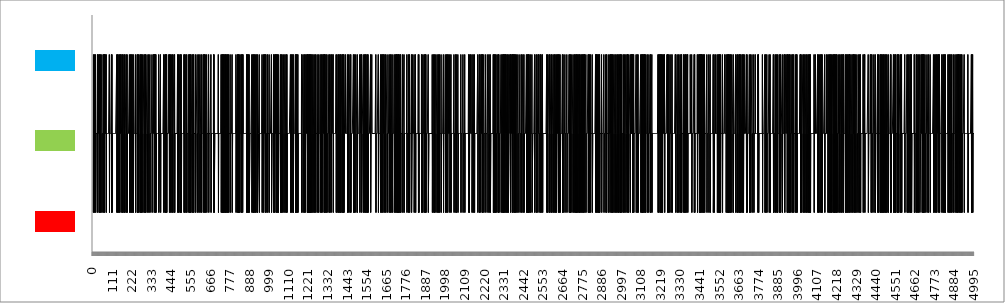
| Category | Series 0 |
|---|---|
| 0.0 | 1 |
| 1.0 | 2 |
| 2.0 | 3 |
| 3.0 | 1 |
| 4.0 | 2 |
| 5.0 | 2 |
| 6.0 | 2 |
| 7.0 | 2 |
| 8.0 | 3 |
| 9.0 | 1 |
| 10.0 | 2 |
| 11.0 | 2 |
| 12.0 | 2 |
| 13.0 | 2 |
| 14.0 | 3 |
| 15.0 | 1 |
| 16.0 | 1 |
| 17.0 | 2 |
| 18.0 | 2 |
| 19.0 | 2 |
| 20.0 | 2 |
| 21.0 | 2 |
| 22.0 | 2 |
| 23.0 | 2 |
| 24.0 | 2 |
| 25.0 | 3 |
| 26.0 | 1 |
| 27.0 | 2 |
| 28.0 | 3 |
| 29.0 | 2 |
| 30.0 | 2 |
| 31.0 | 2 |
| 32.0 | 2 |
| 33.0 | 2 |
| 34.0 | 3 |
| 35.0 | 1 |
| 36.0 | 2 |
| 37.0 | 2 |
| 38.0 | 3 |
| 39.0 | 1 |
| 40.0 | 1 |
| 41.0 | 1 |
| 42.0 | 2 |
| 43.0 | 3 |
| 44.0 | 1 |
| 45.0 | 2 |
| 46.0 | 2 |
| 47.0 | 2 |
| 48.0 | 2 |
| 49.0 | 2 |
| 50.0 | 3 |
| 51.0 | 1 |
| 52.0 | 2 |
| 53.0 | 2 |
| 54.0 | 2 |
| 55.0 | 2 |
| 56.0 | 2 |
| 57.0 | 2 |
| 58.0 | 2 |
| 59.0 | 3 |
| 60.0 | 1 |
| 61.0 | 2 |
| 62.0 | 3 |
| 63.0 | 2 |
| 64.0 | 3 |
| 65.0 | 1 |
| 66.0 | 2 |
| 67.0 | 2 |
| 68.0 | 2 |
| 69.0 | 3 |
| 70.0 | 2 |
| 71.0 | 2 |
| 72.0 | 2 |
| 73.0 | 2 |
| 74.0 | 3 |
| 75.0 | 1 |
| 76.0 | 2 |
| 77.0 | 2 |
| 78.0 | 2 |
| 79.0 | 2 |
| 80.0 | 2 |
| 81.0 | 2 |
| 82.0 | 2 |
| 83.0 | 2 |
| 84.0 | 2 |
| 85.0 | 2 |
| 86.0 | 2 |
| 87.0 | 2 |
| 88.0 | 2 |
| 89.0 | 2 |
| 90.0 | 2 |
| 91.0 | 2 |
| 92.0 | 3 |
| 93.0 | 1 |
| 94.0 | 2 |
| 95.0 | 2 |
| 96.0 | 2 |
| 97.0 | 2 |
| 98.0 | 2 |
| 99.0 | 2 |
| 100.0 | 2 |
| 101.0 | 2 |
| 102.0 | 2 |
| 103.0 | 2 |
| 104.0 | 3 |
| 105.0 | 1 |
| 106.0 | 2 |
| 107.0 | 3 |
| 108.0 | 1 |
| 109.0 | 1 |
| 110.0 | 2 |
| 111.0 | 2 |
| 112.0 | 2 |
| 113.0 | 2 |
| 114.0 | 2 |
| 115.0 | 2 |
| 116.0 | 2 |
| 117.0 | 2 |
| 118.0 | 2 |
| 119.0 | 2 |
| 120.0 | 2 |
| 121.0 | 2 |
| 122.0 | 2 |
| 123.0 | 2 |
| 124.0 | 2 |
| 125.0 | 2 |
| 126.0 | 2 |
| 127.0 | 2 |
| 128.0 | 2 |
| 129.0 | 2 |
| 130.0 | 2 |
| 131.0 | 2 |
| 132.0 | 2 |
| 133.0 | 2 |
| 134.0 | 3 |
| 135.0 | 1 |
| 136.0 | 2 |
| 137.0 | 2 |
| 138.0 | 2 |
| 139.0 | 3 |
| 140.0 | 1 |
| 141.0 | 2 |
| 142.0 | 3 |
| 143.0 | 1 |
| 144.0 | 1 |
| 145.0 | 1 |
| 146.0 | 1 |
| 147.0 | 2 |
| 148.0 | 2 |
| 149.0 | 3 |
| 150.0 | 1 |
| 151.0 | 2 |
| 152.0 | 2 |
| 153.0 | 2 |
| 154.0 | 3 |
| 155.0 | 2 |
| 156.0 | 2 |
| 157.0 | 2 |
| 158.0 | 3 |
| 159.0 | 1 |
| 160.0 | 1 |
| 161.0 | 2 |
| 162.0 | 2 |
| 163.0 | 2 |
| 164.0 | 2 |
| 165.0 | 3 |
| 166.0 | 1 |
| 167.0 | 1 |
| 168.0 | 2 |
| 169.0 | 3 |
| 170.0 | 1 |
| 171.0 | 2 |
| 172.0 | 2 |
| 173.0 | 2 |
| 174.0 | 2 |
| 175.0 | 2 |
| 176.0 | 3 |
| 177.0 | 1 |
| 178.0 | 2 |
| 179.0 | 2 |
| 180.0 | 3 |
| 181.0 | 1 |
| 182.0 | 2 |
| 183.0 | 2 |
| 184.0 | 2 |
| 185.0 | 2 |
| 186.0 | 2 |
| 187.0 | 2 |
| 188.0 | 3 |
| 189.0 | 1 |
| 190.0 | 2 |
| 191.0 | 2 |
| 192.0 | 2 |
| 193.0 | 3 |
| 194.0 | 1 |
| 195.0 | 2 |
| 196.0 | 2 |
| 197.0 | 2 |
| 198.0 | 2 |
| 199.0 | 2 |
| 200.0 | 2 |
| 201.0 | 2 |
| 202.0 | 2 |
| 203.0 | 2 |
| 204.0 | 2 |
| 205.0 | 2 |
| 206.0 | 3 |
| 207.0 | 1 |
| 208.0 | 1 |
| 209.0 | 2 |
| 210.0 | 2 |
| 211.0 | 2 |
| 212.0 | 3 |
| 213.0 | 1 |
| 214.0 | 1 |
| 215.0 | 1 |
| 216.0 | 2 |
| 217.0 | 3 |
| 218.0 | 1 |
| 219.0 | 1 |
| 220.0 | 2 |
| 221.0 | 2 |
| 222.0 | 3 |
| 223.0 | 1 |
| 224.0 | 1 |
| 225.0 | 2 |
| 226.0 | 2 |
| 227.0 | 2 |
| 228.0 | 3 |
| 229.0 | 1 |
| 230.0 | 2 |
| 231.0 | 2 |
| 232.0 | 2 |
| 233.0 | 2 |
| 234.0 | 2 |
| 235.0 | 2 |
| 236.0 | 2 |
| 237.0 | 2 |
| 238.0 | 2 |
| 239.0 | 2 |
| 240.0 | 3 |
| 241.0 | 1 |
| 242.0 | 2 |
| 243.0 | 2 |
| 244.0 | 2 |
| 245.0 | 2 |
| 246.0 | 2 |
| 247.0 | 2 |
| 248.0 | 2 |
| 249.0 | 2 |
| 250.0 | 3 |
| 251.0 | 1 |
| 252.0 | 2 |
| 253.0 | 3 |
| 254.0 | 1 |
| 255.0 | 2 |
| 256.0 | 2 |
| 257.0 | 2 |
| 258.0 | 3 |
| 259.0 | 1 |
| 260.0 | 1 |
| 261.0 | 2 |
| 262.0 | 2 |
| 263.0 | 2 |
| 264.0 | 2 |
| 265.0 | 2 |
| 266.0 | 3 |
| 267.0 | 1 |
| 268.0 | 2 |
| 269.0 | 2 |
| 270.0 | 3 |
| 271.0 | 1 |
| 272.0 | 2 |
| 273.0 | 2 |
| 274.0 | 3 |
| 275.0 | 1 |
| 276.0 | 2 |
| 277.0 | 2 |
| 278.0 | 2 |
| 279.0 | 2 |
| 280.0 | 2 |
| 281.0 | 3 |
| 282.0 | 1 |
| 283.0 | 2 |
| 284.0 | 2 |
| 285.0 | 2 |
| 286.0 | 2 |
| 287.0 | 2 |
| 288.0 | 2 |
| 289.0 | 3 |
| 290.0 | 1 |
| 291.0 | 1 |
| 292.0 | 2 |
| 293.0 | 2 |
| 294.0 | 3 |
| 295.0 | 1 |
| 296.0 | 2 |
| 297.0 | 3 |
| 298.0 | 1 |
| 299.0 | 1 |
| 300.0 | 1 |
| 301.0 | 2 |
| 302.0 | 2 |
| 303.0 | 2 |
| 304.0 | 2 |
| 305.0 | 2 |
| 306.0 | 3 |
| 307.0 | 1 |
| 308.0 | 1 |
| 309.0 | 2 |
| 310.0 | 2 |
| 311.0 | 2 |
| 312.0 | 2 |
| 313.0 | 2 |
| 314.0 | 2 |
| 315.0 | 3 |
| 316.0 | 1 |
| 317.0 | 2 |
| 318.0 | 2 |
| 319.0 | 2 |
| 320.0 | 2 |
| 321.0 | 2 |
| 322.0 | 3 |
| 323.0 | 1 |
| 324.0 | 2 |
| 325.0 | 2 |
| 326.0 | 2 |
| 327.0 | 2 |
| 328.0 | 2 |
| 329.0 | 2 |
| 330.0 | 2 |
| 331.0 | 2 |
| 332.0 | 2 |
| 333.0 | 2 |
| 334.0 | 3 |
| 335.0 | 1 |
| 336.0 | 1 |
| 337.0 | 2 |
| 338.0 | 2 |
| 339.0 | 2 |
| 340.0 | 2 |
| 341.0 | 2 |
| 342.0 | 2 |
| 343.0 | 3 |
| 344.0 | 2 |
| 345.0 | 2 |
| 346.0 | 3 |
| 347.0 | 1 |
| 348.0 | 2 |
| 349.0 | 2 |
| 350.0 | 3 |
| 351.0 | 2 |
| 352.0 | 3 |
| 353.0 | 1 |
| 354.0 | 2 |
| 355.0 | 2 |
| 356.0 | 3 |
| 357.0 | 1 |
| 358.0 | 1 |
| 359.0 | 2 |
| 360.0 | 2 |
| 361.0 | 2 |
| 362.0 | 2 |
| 363.0 | 2 |
| 364.0 | 2 |
| 365.0 | 2 |
| 366.0 | 2 |
| 367.0 | 2 |
| 368.0 | 2 |
| 369.0 | 2 |
| 370.0 | 2 |
| 371.0 | 2 |
| 372.0 | 3 |
| 373.0 | 1 |
| 374.0 | 1 |
| 375.0 | 1 |
| 376.0 | 1 |
| 377.0 | 2 |
| 378.0 | 2 |
| 379.0 | 2 |
| 380.0 | 2 |
| 381.0 | 2 |
| 382.0 | 3 |
| 383.0 | 1 |
| 384.0 | 2 |
| 385.0 | 2 |
| 386.0 | 2 |
| 387.0 | 2 |
| 388.0 | 2 |
| 389.0 | 2 |
| 390.0 | 2 |
| 391.0 | 2 |
| 392.0 | 2 |
| 393.0 | 2 |
| 394.0 | 2 |
| 395.0 | 2 |
| 396.0 | 2 |
| 397.0 | 2 |
| 398.0 | 2 |
| 399.0 | 2 |
| 400.0 | 3 |
| 401.0 | 1 |
| 402.0 | 1 |
| 403.0 | 2 |
| 404.0 | 2 |
| 405.0 | 2 |
| 406.0 | 2 |
| 407.0 | 3 |
| 408.0 | 1 |
| 409.0 | 2 |
| 410.0 | 2 |
| 411.0 | 3 |
| 412.0 | 1 |
| 413.0 | 2 |
| 414.0 | 3 |
| 415.0 | 1 |
| 416.0 | 2 |
| 417.0 | 3 |
| 418.0 | 1 |
| 419.0 | 2 |
| 420.0 | 2 |
| 421.0 | 2 |
| 422.0 | 2 |
| 423.0 | 2 |
| 424.0 | 2 |
| 425.0 | 2 |
| 426.0 | 2 |
| 427.0 | 2 |
| 428.0 | 2 |
| 429.0 | 2 |
| 430.0 | 3 |
| 431.0 | 2 |
| 432.0 | 3 |
| 433.0 | 1 |
| 434.0 | 2 |
| 435.0 | 2 |
| 436.0 | 2 |
| 437.0 | 2 |
| 438.0 | 2 |
| 439.0 | 3 |
| 440.0 | 1 |
| 441.0 | 2 |
| 442.0 | 2 |
| 443.0 | 2 |
| 444.0 | 2 |
| 445.0 | 2 |
| 446.0 | 3 |
| 447.0 | 1 |
| 448.0 | 2 |
| 449.0 | 2 |
| 450.0 | 2 |
| 451.0 | 3 |
| 452.0 | 1 |
| 453.0 | 2 |
| 454.0 | 2 |
| 455.0 | 2 |
| 456.0 | 2 |
| 457.0 | 2 |
| 458.0 | 2 |
| 459.0 | 3 |
| 460.0 | 1 |
| 461.0 | 2 |
| 462.0 | 3 |
| 463.0 | 1 |
| 464.0 | 2 |
| 465.0 | 2 |
| 466.0 | 2 |
| 467.0 | 2 |
| 468.0 | 2 |
| 469.0 | 2 |
| 470.0 | 2 |
| 471.0 | 2 |
| 472.0 | 2 |
| 473.0 | 2 |
| 474.0 | 2 |
| 475.0 | 2 |
| 476.0 | 2 |
| 477.0 | 2 |
| 478.0 | 2 |
| 479.0 | 3 |
| 480.0 | 1 |
| 481.0 | 2 |
| 482.0 | 2 |
| 483.0 | 2 |
| 484.0 | 3 |
| 485.0 | 1 |
| 486.0 | 1 |
| 487.0 | 2 |
| 488.0 | 2 |
| 489.0 | 2 |
| 490.0 | 2 |
| 491.0 | 2 |
| 492.0 | 3 |
| 493.0 | 1 |
| 494.0 | 2 |
| 495.0 | 3 |
| 496.0 | 1 |
| 497.0 | 2 |
| 498.0 | 2 |
| 499.0 | 2 |
| 500.0 | 3 |
| 501.0 | 1 |
| 502.0 | 2 |
| 503.0 | 2 |
| 504.0 | 2 |
| 505.0 | 2 |
| 506.0 | 2 |
| 507.0 | 2 |
| 508.0 | 2 |
| 509.0 | 2 |
| 510.0 | 2 |
| 511.0 | 2 |
| 512.0 | 2 |
| 513.0 | 2 |
| 514.0 | 2 |
| 515.0 | 3 |
| 516.0 | 1 |
| 517.0 | 2 |
| 518.0 | 2 |
| 519.0 | 3 |
| 520.0 | 1 |
| 521.0 | 2 |
| 522.0 | 2 |
| 523.0 | 2 |
| 524.0 | 2 |
| 525.0 | 2 |
| 526.0 | 3 |
| 527.0 | 1 |
| 528.0 | 1 |
| 529.0 | 2 |
| 530.0 | 2 |
| 531.0 | 3 |
| 532.0 | 1 |
| 533.0 | 2 |
| 534.0 | 2 |
| 535.0 | 2 |
| 536.0 | 2 |
| 537.0 | 2 |
| 538.0 | 2 |
| 539.0 | 2 |
| 540.0 | 2 |
| 541.0 | 2 |
| 542.0 | 3 |
| 543.0 | 1 |
| 544.0 | 2 |
| 545.0 | 2 |
| 546.0 | 3 |
| 547.0 | 1 |
| 548.0 | 2 |
| 549.0 | 2 |
| 550.0 | 3 |
| 551.0 | 1 |
| 552.0 | 2 |
| 553.0 | 3 |
| 554.0 | 1 |
| 555.0 | 1 |
| 556.0 | 1 |
| 557.0 | 2 |
| 558.0 | 2 |
| 559.0 | 2 |
| 560.0 | 2 |
| 561.0 | 3 |
| 562.0 | 1 |
| 563.0 | 1 |
| 564.0 | 1 |
| 565.0 | 2 |
| 566.0 | 3 |
| 567.0 | 1 |
| 568.0 | 2 |
| 569.0 | 2 |
| 570.0 | 3 |
| 571.0 | 1 |
| 572.0 | 2 |
| 573.0 | 2 |
| 574.0 | 2 |
| 575.0 | 2 |
| 576.0 | 2 |
| 577.0 | 2 |
| 578.0 | 2 |
| 579.0 | 2 |
| 580.0 | 3 |
| 581.0 | 1 |
| 582.0 | 1 |
| 583.0 | 1 |
| 584.0 | 2 |
| 585.0 | 2 |
| 586.0 | 2 |
| 587.0 | 2 |
| 588.0 | 2 |
| 589.0 | 2 |
| 590.0 | 3 |
| 591.0 | 1 |
| 592.0 | 2 |
| 593.0 | 2 |
| 594.0 | 2 |
| 595.0 | 2 |
| 596.0 | 2 |
| 597.0 | 2 |
| 598.0 | 2 |
| 599.0 | 3 |
| 600.0 | 1 |
| 601.0 | 2 |
| 602.0 | 2 |
| 603.0 | 2 |
| 604.0 | 2 |
| 605.0 | 2 |
| 606.0 | 3 |
| 607.0 | 1 |
| 608.0 | 2 |
| 609.0 | 2 |
| 610.0 | 2 |
| 611.0 | 2 |
| 612.0 | 2 |
| 613.0 | 2 |
| 614.0 | 3 |
| 615.0 | 1 |
| 616.0 | 2 |
| 617.0 | 2 |
| 618.0 | 2 |
| 619.0 | 2 |
| 620.0 | 2 |
| 621.0 | 2 |
| 622.0 | 2 |
| 623.0 | 2 |
| 624.0 | 3 |
| 625.0 | 1 |
| 626.0 | 2 |
| 627.0 | 2 |
| 628.0 | 3 |
| 629.0 | 2 |
| 630.0 | 2 |
| 631.0 | 3 |
| 632.0 | 1 |
| 633.0 | 1 |
| 634.0 | 2 |
| 635.0 | 2 |
| 636.0 | 3 |
| 637.0 | 1 |
| 638.0 | 2 |
| 639.0 | 2 |
| 640.0 | 2 |
| 641.0 | 2 |
| 642.0 | 2 |
| 643.0 | 2 |
| 644.0 | 3 |
| 645.0 | 1 |
| 646.0 | 2 |
| 647.0 | 2 |
| 648.0 | 2 |
| 649.0 | 2 |
| 650.0 | 2 |
| 651.0 | 2 |
| 652.0 | 2 |
| 653.0 | 2 |
| 654.0 | 2 |
| 655.0 | 3 |
| 656.0 | 1 |
| 657.0 | 2 |
| 658.0 | 2 |
| 659.0 | 2 |
| 660.0 | 2 |
| 661.0 | 2 |
| 662.0 | 2 |
| 663.0 | 2 |
| 664.0 | 2 |
| 665.0 | 2 |
| 666.0 | 2 |
| 667.0 | 2 |
| 668.0 | 3 |
| 669.0 | 1 |
| 670.0 | 2 |
| 671.0 | 2 |
| 672.0 | 2 |
| 673.0 | 2 |
| 674.0 | 2 |
| 675.0 | 2 |
| 676.0 | 2 |
| 677.0 | 2 |
| 678.0 | 2 |
| 679.0 | 2 |
| 680.0 | 2 |
| 681.0 | 2 |
| 682.0 | 2 |
| 683.0 | 3 |
| 684.0 | 1 |
| 685.0 | 2 |
| 686.0 | 3 |
| 687.0 | 1 |
| 688.0 | 1 |
| 689.0 | 1 |
| 690.0 | 2 |
| 691.0 | 2 |
| 692.0 | 2 |
| 693.0 | 2 |
| 694.0 | 2 |
| 695.0 | 2 |
| 696.0 | 2 |
| 697.0 | 2 |
| 698.0 | 2 |
| 699.0 | 2 |
| 700.0 | 2 |
| 701.0 | 2 |
| 702.0 | 2 |
| 703.0 | 2 |
| 704.0 | 2 |
| 705.0 | 2 |
| 706.0 | 2 |
| 707.0 | 2 |
| 708.0 | 2 |
| 709.0 | 2 |
| 710.0 | 3 |
| 711.0 | 1 |
| 712.0 | 2 |
| 713.0 | 2 |
| 714.0 | 2 |
| 715.0 | 2 |
| 716.0 | 2 |
| 717.0 | 2 |
| 718.0 | 2 |
| 719.0 | 2 |
| 720.0 | 2 |
| 721.0 | 2 |
| 722.0 | 2 |
| 723.0 | 2 |
| 724.0 | 2 |
| 725.0 | 2 |
| 726.0 | 3 |
| 727.0 | 1 |
| 728.0 | 2 |
| 729.0 | 2 |
| 730.0 | 2 |
| 731.0 | 3 |
| 732.0 | 1 |
| 733.0 | 2 |
| 734.0 | 3 |
| 735.0 | 1 |
| 736.0 | 2 |
| 737.0 | 2 |
| 738.0 | 2 |
| 739.0 | 3 |
| 740.0 | 1 |
| 741.0 | 2 |
| 742.0 | 3 |
| 743.0 | 1 |
| 744.0 | 1 |
| 745.0 | 2 |
| 746.0 | 2 |
| 747.0 | 3 |
| 748.0 | 1 |
| 749.0 | 2 |
| 750.0 | 3 |
| 751.0 | 1 |
| 752.0 | 1 |
| 753.0 | 2 |
| 754.0 | 3 |
| 755.0 | 1 |
| 756.0 | 2 |
| 757.0 | 2 |
| 758.0 | 2 |
| 759.0 | 3 |
| 760.0 | 1 |
| 761.0 | 2 |
| 762.0 | 2 |
| 763.0 | 3 |
| 764.0 | 1 |
| 765.0 | 2 |
| 766.0 | 2 |
| 767.0 | 2 |
| 768.0 | 3 |
| 769.0 | 1 |
| 770.0 | 2 |
| 771.0 | 2 |
| 772.0 | 2 |
| 773.0 | 2 |
| 774.0 | 2 |
| 775.0 | 2 |
| 776.0 | 2 |
| 777.0 | 3 |
| 778.0 | 1 |
| 779.0 | 2 |
| 780.0 | 2 |
| 781.0 | 2 |
| 782.0 | 2 |
| 783.0 | 2 |
| 784.0 | 2 |
| 785.0 | 2 |
| 786.0 | 2 |
| 787.0 | 2 |
| 788.0 | 3 |
| 789.0 | 1 |
| 790.0 | 1 |
| 791.0 | 2 |
| 792.0 | 2 |
| 793.0 | 2 |
| 794.0 | 2 |
| 795.0 | 2 |
| 796.0 | 2 |
| 797.0 | 2 |
| 798.0 | 2 |
| 799.0 | 2 |
| 800.0 | 2 |
| 801.0 | 2 |
| 802.0 | 2 |
| 803.0 | 2 |
| 804.0 | 2 |
| 805.0 | 2 |
| 806.0 | 2 |
| 807.0 | 2 |
| 808.0 | 2 |
| 809.0 | 2 |
| 810.0 | 3 |
| 811.0 | 1 |
| 812.0 | 1 |
| 813.0 | 2 |
| 814.0 | 2 |
| 815.0 | 2 |
| 816.0 | 2 |
| 817.0 | 2 |
| 818.0 | 2 |
| 819.0 | 3 |
| 820.0 | 1 |
| 821.0 | 2 |
| 822.0 | 3 |
| 823.0 | 1 |
| 824.0 | 2 |
| 825.0 | 3 |
| 826.0 | 1 |
| 827.0 | 1 |
| 828.0 | 2 |
| 829.0 | 3 |
| 830.0 | 1 |
| 831.0 | 2 |
| 832.0 | 2 |
| 833.0 | 2 |
| 834.0 | 2 |
| 835.0 | 2 |
| 836.0 | 2 |
| 837.0 | 2 |
| 838.0 | 3 |
| 839.0 | 1 |
| 840.0 | 2 |
| 841.0 | 3 |
| 842.0 | 1 |
| 843.0 | 2 |
| 844.0 | 2 |
| 845.0 | 2 |
| 846.0 | 2 |
| 847.0 | 3 |
| 848.0 | 1 |
| 849.0 | 2 |
| 850.0 | 3 |
| 851.0 | 2 |
| 852.0 | 2 |
| 853.0 | 2 |
| 854.0 | 2 |
| 855.0 | 2 |
| 856.0 | 2 |
| 857.0 | 2 |
| 858.0 | 2 |
| 859.0 | 2 |
| 860.0 | 2 |
| 861.0 | 2 |
| 862.0 | 2 |
| 863.0 | 2 |
| 864.0 | 2 |
| 865.0 | 2 |
| 866.0 | 2 |
| 867.0 | 2 |
| 868.0 | 2 |
| 869.0 | 2 |
| 870.0 | 3 |
| 871.0 | 1 |
| 872.0 | 2 |
| 873.0 | 3 |
| 874.0 | 1 |
| 875.0 | 2 |
| 876.0 | 2 |
| 877.0 | 3 |
| 878.0 | 1 |
| 879.0 | 2 |
| 880.0 | 3 |
| 881.0 | 1 |
| 882.0 | 2 |
| 883.0 | 2 |
| 884.0 | 2 |
| 885.0 | 3 |
| 886.0 | 1 |
| 887.0 | 1 |
| 888.0 | 1 |
| 889.0 | 2 |
| 890.0 | 2 |
| 891.0 | 2 |
| 892.0 | 2 |
| 893.0 | 2 |
| 894.0 | 2 |
| 895.0 | 2 |
| 896.0 | 2 |
| 897.0 | 2 |
| 898.0 | 2 |
| 899.0 | 2 |
| 900.0 | 3 |
| 901.0 | 1 |
| 902.0 | 2 |
| 903.0 | 2 |
| 904.0 | 2 |
| 905.0 | 2 |
| 906.0 | 3 |
| 907.0 | 1 |
| 908.0 | 2 |
| 909.0 | 3 |
| 910.0 | 1 |
| 911.0 | 1 |
| 912.0 | 1 |
| 913.0 | 2 |
| 914.0 | 2 |
| 915.0 | 3 |
| 916.0 | 1 |
| 917.0 | 2 |
| 918.0 | 2 |
| 919.0 | 2 |
| 920.0 | 3 |
| 921.0 | 1 |
| 922.0 | 2 |
| 923.0 | 2 |
| 924.0 | 2 |
| 925.0 | 2 |
| 926.0 | 2 |
| 927.0 | 2 |
| 928.0 | 3 |
| 929.0 | 1 |
| 930.0 | 2 |
| 931.0 | 3 |
| 932.0 | 1 |
| 933.0 | 1 |
| 934.0 | 1 |
| 935.0 | 1 |
| 936.0 | 1 |
| 937.0 | 1 |
| 938.0 | 2 |
| 939.0 | 2 |
| 940.0 | 2 |
| 941.0 | 2 |
| 942.0 | 3 |
| 943.0 | 1 |
| 944.0 | 2 |
| 945.0 | 2 |
| 946.0 | 2 |
| 947.0 | 2 |
| 948.0 | 2 |
| 949.0 | 2 |
| 950.0 | 2 |
| 951.0 | 2 |
| 952.0 | 2 |
| 953.0 | 2 |
| 954.0 | 2 |
| 955.0 | 2 |
| 956.0 | 2 |
| 957.0 | 2 |
| 958.0 | 3 |
| 959.0 | 1 |
| 960.0 | 2 |
| 961.0 | 2 |
| 962.0 | 2 |
| 963.0 | 2 |
| 964.0 | 2 |
| 965.0 | 2 |
| 966.0 | 3 |
| 967.0 | 1 |
| 968.0 | 1 |
| 969.0 | 2 |
| 970.0 | 2 |
| 971.0 | 2 |
| 972.0 | 3 |
| 973.0 | 2 |
| 974.0 | 2 |
| 975.0 | 2 |
| 976.0 | 3 |
| 977.0 | 1 |
| 978.0 | 2 |
| 979.0 | 2 |
| 980.0 | 3 |
| 981.0 | 1 |
| 982.0 | 2 |
| 983.0 | 2 |
| 984.0 | 2 |
| 985.0 | 2 |
| 986.0 | 2 |
| 987.0 | 2 |
| 988.0 | 2 |
| 989.0 | 3 |
| 990.0 | 1 |
| 991.0 | 2 |
| 992.0 | 2 |
| 993.0 | 2 |
| 994.0 | 2 |
| 995.0 | 2 |
| 996.0 | 2 |
| 997.0 | 2 |
| 998.0 | 3 |
| 999.0 | 1 |
| 1000.0 | 2 |
| 1001.0 | 2 |
| 1002.0 | 2 |
| 1003.0 | 2 |
| 1004.0 | 2 |
| 1005.0 | 2 |
| 1006.0 | 2 |
| 1007.0 | 2 |
| 1008.0 | 2 |
| 1009.0 | 2 |
| 1010.0 | 2 |
| 1011.0 | 3 |
| 1012.0 | 1 |
| 1013.0 | 1 |
| 1014.0 | 1 |
| 1015.0 | 2 |
| 1016.0 | 2 |
| 1017.0 | 2 |
| 1018.0 | 2 |
| 1019.0 | 2 |
| 1020.0 | 2 |
| 1021.0 | 2 |
| 1022.0 | 2 |
| 1023.0 | 3 |
| 1024.0 | 1 |
| 1025.0 | 2 |
| 1026.0 | 2 |
| 1027.0 | 2 |
| 1028.0 | 3 |
| 1029.0 | 1 |
| 1030.0 | 2 |
| 1031.0 | 2 |
| 1032.0 | 2 |
| 1033.0 | 2 |
| 1034.0 | 3 |
| 1035.0 | 2 |
| 1036.0 | 2 |
| 1037.0 | 3 |
| 1038.0 | 1 |
| 1039.0 | 2 |
| 1040.0 | 2 |
| 1041.0 | 3 |
| 1042.0 | 1 |
| 1043.0 | 2 |
| 1044.0 | 2 |
| 1045.0 | 2 |
| 1046.0 | 3 |
| 1047.0 | 1 |
| 1048.0 | 2 |
| 1049.0 | 2 |
| 1050.0 | 3 |
| 1051.0 | 1 |
| 1052.0 | 1 |
| 1053.0 | 2 |
| 1054.0 | 2 |
| 1055.0 | 2 |
| 1056.0 | 2 |
| 1057.0 | 2 |
| 1058.0 | 2 |
| 1059.0 | 2 |
| 1060.0 | 2 |
| 1061.0 | 2 |
| 1062.0 | 3 |
| 1063.0 | 1 |
| 1064.0 | 2 |
| 1065.0 | 2 |
| 1066.0 | 2 |
| 1067.0 | 3 |
| 1068.0 | 1 |
| 1069.0 | 1 |
| 1070.0 | 2 |
| 1071.0 | 2 |
| 1072.0 | 3 |
| 1073.0 | 1 |
| 1074.0 | 1 |
| 1075.0 | 2 |
| 1076.0 | 2 |
| 1077.0 | 2 |
| 1078.0 | 2 |
| 1079.0 | 2 |
| 1080.0 | 2 |
| 1081.0 | 3 |
| 1082.0 | 1 |
| 1083.0 | 2 |
| 1084.0 | 2 |
| 1085.0 | 2 |
| 1086.0 | 2 |
| 1087.0 | 2 |
| 1088.0 | 3 |
| 1089.0 | 1 |
| 1090.0 | 2 |
| 1091.0 | 2 |
| 1092.0 | 2 |
| 1093.0 | 2 |
| 1094.0 | 2 |
| 1095.0 | 3 |
| 1096.0 | 1 |
| 1097.0 | 1 |
| 1098.0 | 2 |
| 1099.0 | 3 |
| 1100.0 | 1 |
| 1101.0 | 2 |
| 1102.0 | 2 |
| 1103.0 | 2 |
| 1104.0 | 2 |
| 1105.0 | 2 |
| 1106.0 | 2 |
| 1107.0 | 2 |
| 1108.0 | 2 |
| 1109.0 | 2 |
| 1110.0 | 2 |
| 1111.0 | 2 |
| 1112.0 | 2 |
| 1113.0 | 2 |
| 1114.0 | 2 |
| 1115.0 | 2 |
| 1116.0 | 2 |
| 1117.0 | 2 |
| 1118.0 | 2 |
| 1119.0 | 3 |
| 1120.0 | 1 |
| 1121.0 | 2 |
| 1122.0 | 2 |
| 1123.0 | 2 |
| 1124.0 | 2 |
| 1125.0 | 3 |
| 1126.0 | 1 |
| 1127.0 | 2 |
| 1128.0 | 2 |
| 1129.0 | 2 |
| 1130.0 | 2 |
| 1131.0 | 2 |
| 1132.0 | 3 |
| 1133.0 | 1 |
| 1134.0 | 2 |
| 1135.0 | 3 |
| 1136.0 | 1 |
| 1137.0 | 2 |
| 1138.0 | 2 |
| 1139.0 | 2 |
| 1140.0 | 2 |
| 1141.0 | 2 |
| 1142.0 | 2 |
| 1143.0 | 2 |
| 1144.0 | 2 |
| 1145.0 | 2 |
| 1146.0 | 2 |
| 1147.0 | 3 |
| 1148.0 | 1 |
| 1149.0 | 2 |
| 1150.0 | 3 |
| 1151.0 | 1 |
| 1152.0 | 2 |
| 1153.0 | 3 |
| 1154.0 | 1 |
| 1155.0 | 1 |
| 1156.0 | 2 |
| 1157.0 | 3 |
| 1158.0 | 1 |
| 1159.0 | 2 |
| 1160.0 | 2 |
| 1161.0 | 3 |
| 1162.0 | 1 |
| 1163.0 | 2 |
| 1164.0 | 2 |
| 1165.0 | 2 |
| 1166.0 | 2 |
| 1167.0 | 2 |
| 1168.0 | 2 |
| 1169.0 | 2 |
| 1170.0 | 2 |
| 1171.0 | 2 |
| 1172.0 | 2 |
| 1173.0 | 2 |
| 1174.0 | 2 |
| 1175.0 | 2 |
| 1176.0 | 2 |
| 1177.0 | 2 |
| 1178.0 | 2 |
| 1179.0 | 2 |
| 1180.0 | 2 |
| 1181.0 | 2 |
| 1182.0 | 3 |
| 1183.0 | 1 |
| 1184.0 | 2 |
| 1185.0 | 2 |
| 1186.0 | 2 |
| 1187.0 | 2 |
| 1188.0 | 2 |
| 1189.0 | 2 |
| 1190.0 | 3 |
| 1191.0 | 1 |
| 1192.0 | 1 |
| 1193.0 | 2 |
| 1194.0 | 2 |
| 1195.0 | 2 |
| 1196.0 | 2 |
| 1197.0 | 3 |
| 1198.0 | 1 |
| 1199.0 | 2 |
| 1200.0 | 2 |
| 1201.0 | 2 |
| 1202.0 | 3 |
| 1203.0 | 1 |
| 1204.0 | 1 |
| 1205.0 | 2 |
| 1206.0 | 2 |
| 1207.0 | 2 |
| 1208.0 | 3 |
| 1209.0 | 2 |
| 1210.0 | 2 |
| 1211.0 | 2 |
| 1212.0 | 2 |
| 1213.0 | 2 |
| 1214.0 | 3 |
| 1215.0 | 1 |
| 1216.0 | 2 |
| 1217.0 | 3 |
| 1218.0 | 1 |
| 1219.0 | 2 |
| 1220.0 | 3 |
| 1221.0 | 1 |
| 1222.0 | 1 |
| 1223.0 | 2 |
| 1224.0 | 2 |
| 1225.0 | 3 |
| 1226.0 | 1 |
| 1227.0 | 2 |
| 1228.0 | 3 |
| 1229.0 | 1 |
| 1230.0 | 2 |
| 1231.0 | 2 |
| 1232.0 | 3 |
| 1233.0 | 1 |
| 1234.0 | 2 |
| 1235.0 | 2 |
| 1236.0 | 3 |
| 1237.0 | 1 |
| 1238.0 | 1 |
| 1239.0 | 1 |
| 1240.0 | 2 |
| 1241.0 | 3 |
| 1242.0 | 1 |
| 1243.0 | 2 |
| 1244.0 | 2 |
| 1245.0 | 2 |
| 1246.0 | 2 |
| 1247.0 | 3 |
| 1248.0 | 1 |
| 1249.0 | 2 |
| 1250.0 | 2 |
| 1251.0 | 2 |
| 1252.0 | 2 |
| 1253.0 | 2 |
| 1254.0 | 3 |
| 1255.0 | 1 |
| 1256.0 | 2 |
| 1257.0 | 2 |
| 1258.0 | 2 |
| 1259.0 | 2 |
| 1260.0 | 2 |
| 1261.0 | 3 |
| 1262.0 | 1 |
| 1263.0 | 2 |
| 1264.0 | 2 |
| 1265.0 | 2 |
| 1266.0 | 2 |
| 1267.0 | 2 |
| 1268.0 | 2 |
| 1269.0 | 2 |
| 1270.0 | 3 |
| 1271.0 | 1 |
| 1272.0 | 2 |
| 1273.0 | 2 |
| 1274.0 | 2 |
| 1275.0 | 2 |
| 1276.0 | 2 |
| 1277.0 | 3 |
| 1278.0 | 1 |
| 1279.0 | 2 |
| 1280.0 | 2 |
| 1281.0 | 2 |
| 1282.0 | 2 |
| 1283.0 | 2 |
| 1284.0 | 2 |
| 1285.0 | 2 |
| 1286.0 | 2 |
| 1287.0 | 3 |
| 1288.0 | 1 |
| 1289.0 | 1 |
| 1290.0 | 2 |
| 1291.0 | 2 |
| 1292.0 | 2 |
| 1293.0 | 3 |
| 1294.0 | 1 |
| 1295.0 | 1 |
| 1296.0 | 2 |
| 1297.0 | 2 |
| 1298.0 | 3 |
| 1299.0 | 1 |
| 1300.0 | 2 |
| 1301.0 | 2 |
| 1302.0 | 2 |
| 1303.0 | 2 |
| 1304.0 | 3 |
| 1305.0 | 2 |
| 1306.0 | 2 |
| 1307.0 | 2 |
| 1308.0 | 2 |
| 1309.0 | 3 |
| 1310.0 | 1 |
| 1311.0 | 2 |
| 1312.0 | 3 |
| 1313.0 | 1 |
| 1314.0 | 2 |
| 1315.0 | 3 |
| 1316.0 | 1 |
| 1317.0 | 2 |
| 1318.0 | 2 |
| 1319.0 | 2 |
| 1320.0 | 2 |
| 1321.0 | 3 |
| 1322.0 | 1 |
| 1323.0 | 2 |
| 1324.0 | 2 |
| 1325.0 | 2 |
| 1326.0 | 3 |
| 1327.0 | 1 |
| 1328.0 | 2 |
| 1329.0 | 2 |
| 1330.0 | 2 |
| 1331.0 | 2 |
| 1332.0 | 2 |
| 1333.0 | 2 |
| 1334.0 | 2 |
| 1335.0 | 2 |
| 1336.0 | 2 |
| 1337.0 | 3 |
| 1338.0 | 1 |
| 1339.0 | 2 |
| 1340.0 | 2 |
| 1341.0 | 2 |
| 1342.0 | 3 |
| 1343.0 | 1 |
| 1344.0 | 2 |
| 1345.0 | 2 |
| 1346.0 | 2 |
| 1347.0 | 2 |
| 1348.0 | 2 |
| 1349.0 | 3 |
| 1350.0 | 1 |
| 1351.0 | 1 |
| 1352.0 | 2 |
| 1353.0 | 2 |
| 1354.0 | 3 |
| 1355.0 | 2 |
| 1356.0 | 2 |
| 1357.0 | 2 |
| 1358.0 | 2 |
| 1359.0 | 2 |
| 1360.0 | 2 |
| 1361.0 | 3 |
| 1362.0 | 1 |
| 1363.0 | 2 |
| 1364.0 | 2 |
| 1365.0 | 2 |
| 1366.0 | 2 |
| 1367.0 | 2 |
| 1368.0 | 2 |
| 1369.0 | 2 |
| 1370.0 | 2 |
| 1371.0 | 2 |
| 1372.0 | 2 |
| 1373.0 | 2 |
| 1374.0 | 2 |
| 1375.0 | 2 |
| 1376.0 | 2 |
| 1377.0 | 2 |
| 1378.0 | 3 |
| 1379.0 | 1 |
| 1380.0 | 2 |
| 1381.0 | 2 |
| 1382.0 | 2 |
| 1383.0 | 3 |
| 1384.0 | 1 |
| 1385.0 | 2 |
| 1386.0 | 2 |
| 1387.0 | 2 |
| 1388.0 | 2 |
| 1389.0 | 2 |
| 1390.0 | 2 |
| 1391.0 | 3 |
| 1392.0 | 1 |
| 1393.0 | 2 |
| 1394.0 | 2 |
| 1395.0 | 3 |
| 1396.0 | 1 |
| 1397.0 | 1 |
| 1398.0 | 2 |
| 1399.0 | 2 |
| 1400.0 | 2 |
| 1401.0 | 3 |
| 1402.0 | 1 |
| 1403.0 | 2 |
| 1404.0 | 3 |
| 1405.0 | 1 |
| 1406.0 | 2 |
| 1407.0 | 2 |
| 1408.0 | 2 |
| 1409.0 | 2 |
| 1410.0 | 2 |
| 1411.0 | 3 |
| 1412.0 | 1 |
| 1413.0 | 2 |
| 1414.0 | 2 |
| 1415.0 | 3 |
| 1416.0 | 1 |
| 1417.0 | 2 |
| 1418.0 | 2 |
| 1419.0 | 3 |
| 1420.0 | 1 |
| 1421.0 | 2 |
| 1422.0 | 3 |
| 1423.0 | 1 |
| 1424.0 | 1 |
| 1425.0 | 2 |
| 1426.0 | 2 |
| 1427.0 | 2 |
| 1428.0 | 2 |
| 1429.0 | 2 |
| 1430.0 | 2 |
| 1431.0 | 3 |
| 1432.0 | 2 |
| 1433.0 | 2 |
| 1434.0 | 2 |
| 1435.0 | 2 |
| 1436.0 | 2 |
| 1437.0 | 2 |
| 1438.0 | 2 |
| 1439.0 | 2 |
| 1440.0 | 2 |
| 1441.0 | 2 |
| 1442.0 | 3 |
| 1443.0 | 1 |
| 1444.0 | 2 |
| 1445.0 | 2 |
| 1446.0 | 2 |
| 1447.0 | 2 |
| 1448.0 | 2 |
| 1449.0 | 3 |
| 1450.0 | 1 |
| 1451.0 | 2 |
| 1452.0 | 2 |
| 1453.0 | 2 |
| 1454.0 | 2 |
| 1455.0 | 2 |
| 1456.0 | 2 |
| 1457.0 | 3 |
| 1458.0 | 1 |
| 1459.0 | 2 |
| 1460.0 | 2 |
| 1461.0 | 3 |
| 1462.0 | 1 |
| 1463.0 | 1 |
| 1464.0 | 2 |
| 1465.0 | 2 |
| 1466.0 | 2 |
| 1467.0 | 2 |
| 1468.0 | 2 |
| 1469.0 | 2 |
| 1470.0 | 2 |
| 1471.0 | 2 |
| 1472.0 | 2 |
| 1473.0 | 2 |
| 1474.0 | 2 |
| 1475.0 | 2 |
| 1476.0 | 3 |
| 1477.0 | 1 |
| 1478.0 | 2 |
| 1479.0 | 2 |
| 1480.0 | 2 |
| 1481.0 | 3 |
| 1482.0 | 1 |
| 1483.0 | 1 |
| 1484.0 | 2 |
| 1485.0 | 2 |
| 1486.0 | 2 |
| 1487.0 | 2 |
| 1488.0 | 2 |
| 1489.0 | 3 |
| 1490.0 | 1 |
| 1491.0 | 1 |
| 1492.0 | 2 |
| 1493.0 | 2 |
| 1494.0 | 2 |
| 1495.0 | 2 |
| 1496.0 | 2 |
| 1497.0 | 2 |
| 1498.0 | 3 |
| 1499.0 | 1 |
| 1500.0 | 2 |
| 1501.0 | 2 |
| 1502.0 | 2 |
| 1503.0 | 2 |
| 1504.0 | 2 |
| 1505.0 | 2 |
| 1506.0 | 2 |
| 1507.0 | 2 |
| 1508.0 | 2 |
| 1509.0 | 2 |
| 1510.0 | 2 |
| 1511.0 | 2 |
| 1512.0 | 3 |
| 1513.0 | 1 |
| 1514.0 | 2 |
| 1515.0 | 2 |
| 1516.0 | 2 |
| 1517.0 | 2 |
| 1518.0 | 3 |
| 1519.0 | 2 |
| 1520.0 | 2 |
| 1521.0 | 2 |
| 1522.0 | 3 |
| 1523.0 | 1 |
| 1524.0 | 1 |
| 1525.0 | 1 |
| 1526.0 | 2 |
| 1527.0 | 2 |
| 1528.0 | 2 |
| 1529.0 | 2 |
| 1530.0 | 2 |
| 1531.0 | 2 |
| 1532.0 | 3 |
| 1533.0 | 1 |
| 1534.0 | 1 |
| 1535.0 | 2 |
| 1536.0 | 2 |
| 1537.0 | 2 |
| 1538.0 | 2 |
| 1539.0 | 3 |
| 1540.0 | 1 |
| 1541.0 | 1 |
| 1542.0 | 2 |
| 1543.0 | 2 |
| 1544.0 | 2 |
| 1545.0 | 3 |
| 1546.0 | 1 |
| 1547.0 | 2 |
| 1548.0 | 3 |
| 1549.0 | 1 |
| 1550.0 | 2 |
| 1551.0 | 2 |
| 1552.0 | 2 |
| 1553.0 | 2 |
| 1554.0 | 2 |
| 1555.0 | 3 |
| 1556.0 | 1 |
| 1557.0 | 2 |
| 1558.0 | 2 |
| 1559.0 | 3 |
| 1560.0 | 1 |
| 1561.0 | 2 |
| 1562.0 | 2 |
| 1563.0 | 2 |
| 1564.0 | 2 |
| 1565.0 | 2 |
| 1566.0 | 2 |
| 1567.0 | 2 |
| 1568.0 | 2 |
| 1569.0 | 2 |
| 1570.0 | 2 |
| 1571.0 | 2 |
| 1572.0 | 2 |
| 1573.0 | 3 |
| 1574.0 | 1 |
| 1575.0 | 1 |
| 1576.0 | 2 |
| 1577.0 | 2 |
| 1578.0 | 2 |
| 1579.0 | 2 |
| 1580.0 | 3 |
| 1581.0 | 2 |
| 1582.0 | 2 |
| 1583.0 | 2 |
| 1584.0 | 2 |
| 1585.0 | 2 |
| 1586.0 | 2 |
| 1587.0 | 2 |
| 1588.0 | 2 |
| 1589.0 | 2 |
| 1590.0 | 2 |
| 1591.0 | 2 |
| 1592.0 | 2 |
| 1593.0 | 2 |
| 1594.0 | 2 |
| 1595.0 | 2 |
| 1596.0 | 2 |
| 1597.0 | 2 |
| 1598.0 | 2 |
| 1599.0 | 2 |
| 1600.0 | 2 |
| 1601.0 | 2 |
| 1602.0 | 2 |
| 1603.0 | 3 |
| 1604.0 | 1 |
| 1605.0 | 2 |
| 1606.0 | 2 |
| 1607.0 | 2 |
| 1608.0 | 2 |
| 1609.0 | 2 |
| 1610.0 | 2 |
| 1611.0 | 2 |
| 1612.0 | 2 |
| 1613.0 | 2 |
| 1614.0 | 2 |
| 1615.0 | 2 |
| 1616.0 | 2 |
| 1617.0 | 3 |
| 1618.0 | 1 |
| 1619.0 | 1 |
| 1620.0 | 2 |
| 1621.0 | 2 |
| 1622.0 | 2 |
| 1623.0 | 2 |
| 1624.0 | 2 |
| 1625.0 | 2 |
| 1626.0 | 2 |
| 1627.0 | 2 |
| 1628.0 | 2 |
| 1629.0 | 2 |
| 1630.0 | 3 |
| 1631.0 | 1 |
| 1632.0 | 2 |
| 1633.0 | 2 |
| 1634.0 | 2 |
| 1635.0 | 2 |
| 1636.0 | 3 |
| 1637.0 | 1 |
| 1638.0 | 1 |
| 1639.0 | 2 |
| 1640.0 | 2 |
| 1641.0 | 2 |
| 1642.0 | 3 |
| 1643.0 | 1 |
| 1644.0 | 2 |
| 1645.0 | 3 |
| 1646.0 | 2 |
| 1647.0 | 2 |
| 1648.0 | 2 |
| 1649.0 | 2 |
| 1650.0 | 3 |
| 1651.0 | 1 |
| 1652.0 | 2 |
| 1653.0 | 2 |
| 1654.0 | 2 |
| 1655.0 | 2 |
| 1656.0 | 2 |
| 1657.0 | 2 |
| 1658.0 | 3 |
| 1659.0 | 1 |
| 1660.0 | 1 |
| 1661.0 | 2 |
| 1662.0 | 2 |
| 1663.0 | 2 |
| 1664.0 | 2 |
| 1665.0 | 2 |
| 1666.0 | 2 |
| 1667.0 | 3 |
| 1668.0 | 1 |
| 1669.0 | 2 |
| 1670.0 | 2 |
| 1671.0 | 2 |
| 1672.0 | 2 |
| 1673.0 | 2 |
| 1674.0 | 2 |
| 1675.0 | 2 |
| 1676.0 | 2 |
| 1677.0 | 2 |
| 1678.0 | 3 |
| 1679.0 | 1 |
| 1680.0 | 2 |
| 1681.0 | 2 |
| 1682.0 | 2 |
| 1683.0 | 2 |
| 1684.0 | 3 |
| 1685.0 | 1 |
| 1686.0 | 2 |
| 1687.0 | 2 |
| 1688.0 | 2 |
| 1689.0 | 3 |
| 1690.0 | 1 |
| 1691.0 | 2 |
| 1692.0 | 2 |
| 1693.0 | 2 |
| 1694.0 | 2 |
| 1695.0 | 2 |
| 1696.0 | 3 |
| 1697.0 | 1 |
| 1698.0 | 2 |
| 1699.0 | 2 |
| 1700.0 | 2 |
| 1701.0 | 2 |
| 1702.0 | 2 |
| 1703.0 | 2 |
| 1704.0 | 2 |
| 1705.0 | 2 |
| 1706.0 | 2 |
| 1707.0 | 3 |
| 1708.0 | 1 |
| 1709.0 | 1 |
| 1710.0 | 1 |
| 1711.0 | 2 |
| 1712.0 | 2 |
| 1713.0 | 3 |
| 1714.0 | 1 |
| 1715.0 | 2 |
| 1716.0 | 2 |
| 1717.0 | 2 |
| 1718.0 | 3 |
| 1719.0 | 2 |
| 1720.0 | 3 |
| 1721.0 | 1 |
| 1722.0 | 2 |
| 1723.0 | 2 |
| 1724.0 | 2 |
| 1725.0 | 3 |
| 1726.0 | 1 |
| 1727.0 | 2 |
| 1728.0 | 2 |
| 1729.0 | 3 |
| 1730.0 | 1 |
| 1731.0 | 2 |
| 1732.0 | 3 |
| 1733.0 | 1 |
| 1734.0 | 2 |
| 1735.0 | 3 |
| 1736.0 | 1 |
| 1737.0 | 2 |
| 1738.0 | 2 |
| 1739.0 | 2 |
| 1740.0 | 2 |
| 1741.0 | 3 |
| 1742.0 | 1 |
| 1743.0 | 2 |
| 1744.0 | 3 |
| 1745.0 | 1 |
| 1746.0 | 2 |
| 1747.0 | 2 |
| 1748.0 | 2 |
| 1749.0 | 2 |
| 1750.0 | 2 |
| 1751.0 | 2 |
| 1752.0 | 2 |
| 1753.0 | 2 |
| 1754.0 | 2 |
| 1755.0 | 3 |
| 1756.0 | 1 |
| 1757.0 | 2 |
| 1758.0 | 2 |
| 1759.0 | 2 |
| 1760.0 | 2 |
| 1761.0 | 2 |
| 1762.0 | 2 |
| 1763.0 | 3 |
| 1764.0 | 1 |
| 1765.0 | 2 |
| 1766.0 | 2 |
| 1767.0 | 2 |
| 1768.0 | 2 |
| 1769.0 | 2 |
| 1770.0 | 2 |
| 1771.0 | 2 |
| 1772.0 | 2 |
| 1773.0 | 2 |
| 1774.0 | 2 |
| 1775.0 | 2 |
| 1776.0 | 2 |
| 1777.0 | 2 |
| 1778.0 | 2 |
| 1779.0 | 3 |
| 1780.0 | 1 |
| 1781.0 | 2 |
| 1782.0 | 2 |
| 1783.0 | 2 |
| 1784.0 | 2 |
| 1785.0 | 2 |
| 1786.0 | 2 |
| 1787.0 | 2 |
| 1788.0 | 3 |
| 1789.0 | 1 |
| 1790.0 | 1 |
| 1791.0 | 2 |
| 1792.0 | 2 |
| 1793.0 | 2 |
| 1794.0 | 3 |
| 1795.0 | 1 |
| 1796.0 | 2 |
| 1797.0 | 2 |
| 1798.0 | 2 |
| 1799.0 | 2 |
| 1800.0 | 2 |
| 1801.0 | 2 |
| 1802.0 | 2 |
| 1803.0 | 2 |
| 1804.0 | 2 |
| 1805.0 | 3 |
| 1806.0 | 1 |
| 1807.0 | 1 |
| 1808.0 | 1 |
| 1809.0 | 2 |
| 1810.0 | 3 |
| 1811.0 | 2 |
| 1812.0 | 2 |
| 1813.0 | 2 |
| 1814.0 | 2 |
| 1815.0 | 2 |
| 1816.0 | 2 |
| 1817.0 | 2 |
| 1818.0 | 2 |
| 1819.0 | 2 |
| 1820.0 | 3 |
| 1821.0 | 1 |
| 1822.0 | 1 |
| 1823.0 | 2 |
| 1824.0 | 2 |
| 1825.0 | 2 |
| 1826.0 | 2 |
| 1827.0 | 2 |
| 1828.0 | 3 |
| 1829.0 | 1 |
| 1830.0 | 2 |
| 1831.0 | 2 |
| 1832.0 | 2 |
| 1833.0 | 2 |
| 1834.0 | 2 |
| 1835.0 | 2 |
| 1836.0 | 2 |
| 1837.0 | 2 |
| 1838.0 | 2 |
| 1839.0 | 2 |
| 1840.0 | 2 |
| 1841.0 | 2 |
| 1842.0 | 2 |
| 1843.0 | 2 |
| 1844.0 | 3 |
| 1845.0 | 1 |
| 1846.0 | 2 |
| 1847.0 | 3 |
| 1848.0 | 1 |
| 1849.0 | 2 |
| 1850.0 | 2 |
| 1851.0 | 2 |
| 1852.0 | 2 |
| 1853.0 | 2 |
| 1854.0 | 2 |
| 1855.0 | 2 |
| 1856.0 | 2 |
| 1857.0 | 2 |
| 1858.0 | 2 |
| 1859.0 | 2 |
| 1860.0 | 2 |
| 1861.0 | 2 |
| 1862.0 | 3 |
| 1863.0 | 1 |
| 1864.0 | 1 |
| 1865.0 | 2 |
| 1866.0 | 3 |
| 1867.0 | 1 |
| 1868.0 | 2 |
| 1869.0 | 2 |
| 1870.0 | 2 |
| 1871.0 | 2 |
| 1872.0 | 2 |
| 1873.0 | 2 |
| 1874.0 | 2 |
| 1875.0 | 2 |
| 1876.0 | 3 |
| 1877.0 | 1 |
| 1878.0 | 2 |
| 1879.0 | 2 |
| 1880.0 | 2 |
| 1881.0 | 3 |
| 1882.0 | 1 |
| 1883.0 | 2 |
| 1884.0 | 3 |
| 1885.0 | 1 |
| 1886.0 | 2 |
| 1887.0 | 3 |
| 1888.0 | 1 |
| 1889.0 | 2 |
| 1890.0 | 2 |
| 1891.0 | 2 |
| 1892.0 | 2 |
| 1893.0 | 2 |
| 1894.0 | 2 |
| 1895.0 | 2 |
| 1896.0 | 2 |
| 1897.0 | 2 |
| 1898.0 | 2 |
| 1899.0 | 2 |
| 1900.0 | 3 |
| 1901.0 | 1 |
| 1902.0 | 1 |
| 1903.0 | 1 |
| 1904.0 | 2 |
| 1905.0 | 2 |
| 1906.0 | 2 |
| 1907.0 | 2 |
| 1908.0 | 2 |
| 1909.0 | 2 |
| 1910.0 | 2 |
| 1911.0 | 2 |
| 1912.0 | 2 |
| 1913.0 | 2 |
| 1914.0 | 2 |
| 1915.0 | 2 |
| 1916.0 | 2 |
| 1917.0 | 2 |
| 1918.0 | 2 |
| 1919.0 | 2 |
| 1920.0 | 2 |
| 1921.0 | 2 |
| 1922.0 | 2 |
| 1923.0 | 3 |
| 1924.0 | 1 |
| 1925.0 | 2 |
| 1926.0 | 2 |
| 1927.0 | 2 |
| 1928.0 | 2 |
| 1929.0 | 2 |
| 1930.0 | 2 |
| 1931.0 | 3 |
| 1932.0 | 1 |
| 1933.0 | 1 |
| 1934.0 | 2 |
| 1935.0 | 3 |
| 1936.0 | 1 |
| 1937.0 | 1 |
| 1938.0 | 2 |
| 1939.0 | 2 |
| 1940.0 | 2 |
| 1941.0 | 2 |
| 1942.0 | 2 |
| 1943.0 | 3 |
| 1944.0 | 1 |
| 1945.0 | 2 |
| 1946.0 | 2 |
| 1947.0 | 2 |
| 1948.0 | 2 |
| 1949.0 | 2 |
| 1950.0 | 2 |
| 1951.0 | 3 |
| 1952.0 | 1 |
| 1953.0 | 2 |
| 1954.0 | 2 |
| 1955.0 | 2 |
| 1956.0 | 2 |
| 1957.0 | 2 |
| 1958.0 | 3 |
| 1959.0 | 1 |
| 1960.0 | 1 |
| 1961.0 | 1 |
| 1962.0 | 2 |
| 1963.0 | 2 |
| 1964.0 | 3 |
| 1965.0 | 1 |
| 1966.0 | 2 |
| 1967.0 | 2 |
| 1968.0 | 2 |
| 1969.0 | 2 |
| 1970.0 | 2 |
| 1971.0 | 2 |
| 1972.0 | 2 |
| 1973.0 | 3 |
| 1974.0 | 1 |
| 1975.0 | 1 |
| 1976.0 | 2 |
| 1977.0 | 2 |
| 1978.0 | 2 |
| 1979.0 | 2 |
| 1980.0 | 2 |
| 1981.0 | 2 |
| 1982.0 | 2 |
| 1983.0 | 2 |
| 1984.0 | 2 |
| 1985.0 | 2 |
| 1986.0 | 3 |
| 1987.0 | 1 |
| 1988.0 | 2 |
| 1989.0 | 2 |
| 1990.0 | 2 |
| 1991.0 | 2 |
| 1992.0 | 2 |
| 1993.0 | 2 |
| 1994.0 | 2 |
| 1995.0 | 2 |
| 1996.0 | 2 |
| 1997.0 | 3 |
| 1998.0 | 1 |
| 1999.0 | 2 |
| 2000.0 | 2 |
| 2001.0 | 2 |
| 2002.0 | 2 |
| 2003.0 | 2 |
| 2004.0 | 3 |
| 2005.0 | 1 |
| 2006.0 | 2 |
| 2007.0 | 2 |
| 2008.0 | 2 |
| 2009.0 | 2 |
| 2010.0 | 3 |
| 2011.0 | 1 |
| 2012.0 | 2 |
| 2013.0 | 2 |
| 2014.0 | 3 |
| 2015.0 | 2 |
| 2016.0 | 2 |
| 2017.0 | 2 |
| 2018.0 | 2 |
| 2019.0 | 2 |
| 2020.0 | 2 |
| 2021.0 | 2 |
| 2022.0 | 3 |
| 2023.0 | 1 |
| 2024.0 | 1 |
| 2025.0 | 1 |
| 2026.0 | 2 |
| 2027.0 | 2 |
| 2028.0 | 2 |
| 2029.0 | 3 |
| 2030.0 | 1 |
| 2031.0 | 2 |
| 2032.0 | 2 |
| 2033.0 | 2 |
| 2034.0 | 2 |
| 2035.0 | 2 |
| 2036.0 | 2 |
| 2037.0 | 2 |
| 2038.0 | 2 |
| 2039.0 | 2 |
| 2040.0 | 2 |
| 2041.0 | 2 |
| 2042.0 | 2 |
| 2043.0 | 2 |
| 2044.0 | 2 |
| 2045.0 | 2 |
| 2046.0 | 3 |
| 2047.0 | 1 |
| 2048.0 | 2 |
| 2049.0 | 2 |
| 2050.0 | 2 |
| 2051.0 | 2 |
| 2052.0 | 2 |
| 2053.0 | 2 |
| 2054.0 | 2 |
| 2055.0 | 2 |
| 2056.0 | 3 |
| 2057.0 | 1 |
| 2058.0 | 2 |
| 2059.0 | 3 |
| 2060.0 | 1 |
| 2061.0 | 2 |
| 2062.0 | 2 |
| 2063.0 | 2 |
| 2064.0 | 2 |
| 2065.0 | 2 |
| 2066.0 | 2 |
| 2067.0 | 2 |
| 2068.0 | 3 |
| 2069.0 | 1 |
| 2070.0 | 1 |
| 2071.0 | 2 |
| 2072.0 | 2 |
| 2073.0 | 2 |
| 2074.0 | 2 |
| 2075.0 | 2 |
| 2076.0 | 2 |
| 2077.0 | 2 |
| 2078.0 | 2 |
| 2079.0 | 2 |
| 2080.0 | 2 |
| 2081.0 | 2 |
| 2082.0 | 2 |
| 2083.0 | 2 |
| 2084.0 | 2 |
| 2085.0 | 3 |
| 2086.0 | 1 |
| 2087.0 | 2 |
| 2088.0 | 2 |
| 2089.0 | 2 |
| 2090.0 | 2 |
| 2091.0 | 2 |
| 2092.0 | 2 |
| 2093.0 | 2 |
| 2094.0 | 2 |
| 2095.0 | 2 |
| 2096.0 | 2 |
| 2097.0 | 3 |
| 2098.0 | 1 |
| 2099.0 | 2 |
| 2100.0 | 2 |
| 2101.0 | 2 |
| 2102.0 | 2 |
| 2103.0 | 2 |
| 2104.0 | 2 |
| 2105.0 | 2 |
| 2106.0 | 2 |
| 2107.0 | 3 |
| 2108.0 | 1 |
| 2109.0 | 2 |
| 2110.0 | 2 |
| 2111.0 | 2 |
| 2112.0 | 2 |
| 2113.0 | 2 |
| 2114.0 | 2 |
| 2115.0 | 2 |
| 2116.0 | 2 |
| 2117.0 | 2 |
| 2118.0 | 2 |
| 2119.0 | 2 |
| 2120.0 | 2 |
| 2121.0 | 2 |
| 2122.0 | 2 |
| 2123.0 | 2 |
| 2124.0 | 2 |
| 2125.0 | 2 |
| 2126.0 | 2 |
| 2127.0 | 2 |
| 2128.0 | 2 |
| 2129.0 | 3 |
| 2130.0 | 1 |
| 2131.0 | 1 |
| 2132.0 | 2 |
| 2133.0 | 3 |
| 2134.0 | 1 |
| 2135.0 | 2 |
| 2136.0 | 2 |
| 2137.0 | 2 |
| 2138.0 | 2 |
| 2139.0 | 2 |
| 2140.0 | 3 |
| 2141.0 | 2 |
| 2142.0 | 2 |
| 2143.0 | 2 |
| 2144.0 | 2 |
| 2145.0 | 2 |
| 2146.0 | 2 |
| 2147.0 | 2 |
| 2148.0 | 3 |
| 2149.0 | 1 |
| 2150.0 | 1 |
| 2151.0 | 2 |
| 2152.0 | 2 |
| 2153.0 | 2 |
| 2154.0 | 2 |
| 2155.0 | 3 |
| 2156.0 | 1 |
| 2157.0 | 2 |
| 2158.0 | 2 |
| 2159.0 | 2 |
| 2160.0 | 2 |
| 2161.0 | 2 |
| 2162.0 | 3 |
| 2163.0 | 1 |
| 2164.0 | 2 |
| 2165.0 | 2 |
| 2166.0 | 2 |
| 2167.0 | 2 |
| 2168.0 | 2 |
| 2169.0 | 2 |
| 2170.0 | 2 |
| 2171.0 | 2 |
| 2172.0 | 2 |
| 2173.0 | 2 |
| 2174.0 | 2 |
| 2175.0 | 2 |
| 2176.0 | 2 |
| 2177.0 | 2 |
| 2178.0 | 2 |
| 2179.0 | 2 |
| 2180.0 | 2 |
| 2181.0 | 3 |
| 2182.0 | 1 |
| 2183.0 | 1 |
| 2184.0 | 2 |
| 2185.0 | 2 |
| 2186.0 | 2 |
| 2187.0 | 2 |
| 2188.0 | 2 |
| 2189.0 | 2 |
| 2190.0 | 3 |
| 2191.0 | 1 |
| 2192.0 | 2 |
| 2193.0 | 2 |
| 2194.0 | 3 |
| 2195.0 | 1 |
| 2196.0 | 2 |
| 2197.0 | 2 |
| 2198.0 | 2 |
| 2199.0 | 2 |
| 2200.0 | 2 |
| 2201.0 | 3 |
| 2202.0 | 2 |
| 2203.0 | 2 |
| 2204.0 | 2 |
| 2205.0 | 3 |
| 2206.0 | 1 |
| 2207.0 | 2 |
| 2208.0 | 3 |
| 2209.0 | 1 |
| 2210.0 | 2 |
| 2211.0 | 2 |
| 2212.0 | 2 |
| 2213.0 | 2 |
| 2214.0 | 2 |
| 2215.0 | 3 |
| 2216.0 | 1 |
| 2217.0 | 2 |
| 2218.0 | 2 |
| 2219.0 | 2 |
| 2220.0 | 2 |
| 2221.0 | 2 |
| 2222.0 | 2 |
| 2223.0 | 2 |
| 2224.0 | 2 |
| 2225.0 | 2 |
| 2226.0 | 3 |
| 2227.0 | 1 |
| 2228.0 | 2 |
| 2229.0 | 2 |
| 2230.0 | 2 |
| 2231.0 | 2 |
| 2232.0 | 2 |
| 2233.0 | 2 |
| 2234.0 | 2 |
| 2235.0 | 2 |
| 2236.0 | 2 |
| 2237.0 | 2 |
| 2238.0 | 3 |
| 2239.0 | 1 |
| 2240.0 | 2 |
| 2241.0 | 2 |
| 2242.0 | 2 |
| 2243.0 | 2 |
| 2244.0 | 2 |
| 2245.0 | 3 |
| 2246.0 | 1 |
| 2247.0 | 2 |
| 2248.0 | 2 |
| 2249.0 | 2 |
| 2250.0 | 2 |
| 2251.0 | 2 |
| 2252.0 | 3 |
| 2253.0 | 1 |
| 2254.0 | 1 |
| 2255.0 | 2 |
| 2256.0 | 2 |
| 2257.0 | 2 |
| 2258.0 | 2 |
| 2259.0 | 2 |
| 2260.0 | 2 |
| 2261.0 | 2 |
| 2262.0 | 2 |
| 2263.0 | 2 |
| 2264.0 | 2 |
| 2265.0 | 2 |
| 2266.0 | 2 |
| 2267.0 | 2 |
| 2268.0 | 2 |
| 2269.0 | 3 |
| 2270.0 | 1 |
| 2271.0 | 2 |
| 2272.0 | 3 |
| 2273.0 | 1 |
| 2274.0 | 2 |
| 2275.0 | 2 |
| 2276.0 | 2 |
| 2277.0 | 3 |
| 2278.0 | 1 |
| 2279.0 | 2 |
| 2280.0 | 3 |
| 2281.0 | 1 |
| 2282.0 | 2 |
| 2283.0 | 2 |
| 2284.0 | 2 |
| 2285.0 | 3 |
| 2286.0 | 1 |
| 2287.0 | 2 |
| 2288.0 | 2 |
| 2289.0 | 2 |
| 2290.0 | 2 |
| 2291.0 | 2 |
| 2292.0 | 2 |
| 2293.0 | 2 |
| 2294.0 | 2 |
| 2295.0 | 3 |
| 2296.0 | 1 |
| 2297.0 | 2 |
| 2298.0 | 3 |
| 2299.0 | 1 |
| 2300.0 | 2 |
| 2301.0 | 3 |
| 2302.0 | 1 |
| 2303.0 | 2 |
| 2304.0 | 2 |
| 2305.0 | 2 |
| 2306.0 | 2 |
| 2307.0 | 2 |
| 2308.0 | 2 |
| 2309.0 | 2 |
| 2310.0 | 2 |
| 2311.0 | 2 |
| 2312.0 | 2 |
| 2313.0 | 3 |
| 2314.0 | 1 |
| 2315.0 | 2 |
| 2316.0 | 2 |
| 2317.0 | 2 |
| 2318.0 | 2 |
| 2319.0 | 3 |
| 2320.0 | 1 |
| 2321.0 | 2 |
| 2322.0 | 2 |
| 2323.0 | 2 |
| 2324.0 | 3 |
| 2325.0 | 1 |
| 2326.0 | 2 |
| 2327.0 | 3 |
| 2328.0 | 1 |
| 2329.0 | 1 |
| 2330.0 | 2 |
| 2331.0 | 3 |
| 2332.0 | 1 |
| 2333.0 | 2 |
| 2334.0 | 3 |
| 2335.0 | 2 |
| 2336.0 | 2 |
| 2337.0 | 2 |
| 2338.0 | 2 |
| 2339.0 | 3 |
| 2340.0 | 1 |
| 2341.0 | 2 |
| 2342.0 | 3 |
| 2343.0 | 1 |
| 2344.0 | 2 |
| 2345.0 | 2 |
| 2346.0 | 2 |
| 2347.0 | 2 |
| 2348.0 | 2 |
| 2349.0 | 3 |
| 2350.0 | 1 |
| 2351.0 | 2 |
| 2352.0 | 2 |
| 2353.0 | 2 |
| 2354.0 | 3 |
| 2355.0 | 1 |
| 2356.0 | 1 |
| 2357.0 | 1 |
| 2358.0 | 2 |
| 2359.0 | 2 |
| 2360.0 | 2 |
| 2361.0 | 2 |
| 2362.0 | 2 |
| 2363.0 | 3 |
| 2364.0 | 2 |
| 2365.0 | 2 |
| 2366.0 | 3 |
| 2367.0 | 1 |
| 2368.0 | 1 |
| 2369.0 | 2 |
| 2370.0 | 3 |
| 2371.0 | 2 |
| 2372.0 | 2 |
| 2373.0 | 2 |
| 2374.0 | 2 |
| 2375.0 | 2 |
| 2376.0 | 3 |
| 2377.0 | 1 |
| 2378.0 | 2 |
| 2379.0 | 3 |
| 2380.0 | 1 |
| 2381.0 | 2 |
| 2382.0 | 3 |
| 2383.0 | 2 |
| 2384.0 | 2 |
| 2385.0 | 2 |
| 2386.0 | 3 |
| 2387.0 | 1 |
| 2388.0 | 2 |
| 2389.0 | 2 |
| 2390.0 | 3 |
| 2391.0 | 1 |
| 2392.0 | 2 |
| 2393.0 | 2 |
| 2394.0 | 2 |
| 2395.0 | 3 |
| 2396.0 | 1 |
| 2397.0 | 2 |
| 2398.0 | 2 |
| 2399.0 | 2 |
| 2400.0 | 2 |
| 2401.0 | 2 |
| 2402.0 | 3 |
| 2403.0 | 1 |
| 2404.0 | 2 |
| 2405.0 | 2 |
| 2406.0 | 2 |
| 2407.0 | 2 |
| 2408.0 | 2 |
| 2409.0 | 3 |
| 2410.0 | 1 |
| 2411.0 | 2 |
| 2412.0 | 2 |
| 2413.0 | 2 |
| 2414.0 | 2 |
| 2415.0 | 2 |
| 2416.0 | 2 |
| 2417.0 | 2 |
| 2418.0 | 2 |
| 2419.0 | 2 |
| 2420.0 | 3 |
| 2421.0 | 1 |
| 2422.0 | 2 |
| 2423.0 | 2 |
| 2424.0 | 2 |
| 2425.0 | 2 |
| 2426.0 | 2 |
| 2427.0 | 2 |
| 2428.0 | 2 |
| 2429.0 | 3 |
| 2430.0 | 1 |
| 2431.0 | 1 |
| 2432.0 | 2 |
| 2433.0 | 2 |
| 2434.0 | 2 |
| 2435.0 | 2 |
| 2436.0 | 2 |
| 2437.0 | 3 |
| 2438.0 | 1 |
| 2439.0 | 1 |
| 2440.0 | 2 |
| 2441.0 | 2 |
| 2442.0 | 2 |
| 2443.0 | 3 |
| 2444.0 | 1 |
| 2445.0 | 1 |
| 2446.0 | 2 |
| 2447.0 | 2 |
| 2448.0 | 2 |
| 2449.0 | 2 |
| 2450.0 | 2 |
| 2451.0 | 2 |
| 2452.0 | 2 |
| 2453.0 | 2 |
| 2454.0 | 2 |
| 2455.0 | 2 |
| 2456.0 | 2 |
| 2457.0 | 3 |
| 2458.0 | 1 |
| 2459.0 | 1 |
| 2460.0 | 2 |
| 2461.0 | 2 |
| 2462.0 | 3 |
| 2463.0 | 1 |
| 2464.0 | 1 |
| 2465.0 | 2 |
| 2466.0 | 3 |
| 2467.0 | 1 |
| 2468.0 | 2 |
| 2469.0 | 3 |
| 2470.0 | 1 |
| 2471.0 | 2 |
| 2472.0 | 3 |
| 2473.0 | 1 |
| 2474.0 | 2 |
| 2475.0 | 2 |
| 2476.0 | 2 |
| 2477.0 | 2 |
| 2478.0 | 2 |
| 2479.0 | 3 |
| 2480.0 | 1 |
| 2481.0 | 2 |
| 2482.0 | 2 |
| 2483.0 | 2 |
| 2484.0 | 2 |
| 2485.0 | 2 |
| 2486.0 | 2 |
| 2487.0 | 2 |
| 2488.0 | 3 |
| 2489.0 | 1 |
| 2490.0 | 1 |
| 2491.0 | 1 |
| 2492.0 | 1 |
| 2493.0 | 2 |
| 2494.0 | 2 |
| 2495.0 | 2 |
| 2496.0 | 2 |
| 2497.0 | 2 |
| 2498.0 | 2 |
| 2499.0 | 2 |
| 2500.0 | 2 |
| 2501.0 | 2 |
| 2502.0 | 2 |
| 2503.0 | 3 |
| 2504.0 | 1 |
| 2505.0 | 2 |
| 2506.0 | 2 |
| 2507.0 | 2 |
| 2508.0 | 2 |
| 2509.0 | 2 |
| 2510.0 | 2 |
| 2511.0 | 2 |
| 2512.0 | 3 |
| 2513.0 | 1 |
| 2514.0 | 2 |
| 2515.0 | 2 |
| 2516.0 | 2 |
| 2517.0 | 3 |
| 2518.0 | 1 |
| 2519.0 | 2 |
| 2520.0 | 2 |
| 2521.0 | 2 |
| 2522.0 | 2 |
| 2523.0 | 2 |
| 2524.0 | 2 |
| 2525.0 | 3 |
| 2526.0 | 2 |
| 2527.0 | 2 |
| 2528.0 | 3 |
| 2529.0 | 1 |
| 2530.0 | 2 |
| 2531.0 | 2 |
| 2532.0 | 2 |
| 2533.0 | 2 |
| 2534.0 | 2 |
| 2535.0 | 2 |
| 2536.0 | 2 |
| 2537.0 | 3 |
| 2538.0 | 1 |
| 2539.0 | 2 |
| 2540.0 | 3 |
| 2541.0 | 1 |
| 2542.0 | 2 |
| 2543.0 | 2 |
| 2544.0 | 2 |
| 2545.0 | 2 |
| 2546.0 | 2 |
| 2547.0 | 2 |
| 2548.0 | 3 |
| 2549.0 | 1 |
| 2550.0 | 2 |
| 2551.0 | 2 |
| 2552.0 | 2 |
| 2553.0 | 2 |
| 2554.0 | 2 |
| 2555.0 | 2 |
| 2556.0 | 2 |
| 2557.0 | 2 |
| 2558.0 | 2 |
| 2559.0 | 2 |
| 2560.0 | 2 |
| 2561.0 | 2 |
| 2562.0 | 2 |
| 2563.0 | 2 |
| 2564.0 | 2 |
| 2565.0 | 2 |
| 2566.0 | 2 |
| 2567.0 | 2 |
| 2568.0 | 2 |
| 2569.0 | 2 |
| 2570.0 | 2 |
| 2571.0 | 2 |
| 2572.0 | 3 |
| 2573.0 | 1 |
| 2574.0 | 2 |
| 2575.0 | 2 |
| 2576.0 | 3 |
| 2577.0 | 1 |
| 2578.0 | 1 |
| 2579.0 | 2 |
| 2580.0 | 2 |
| 2581.0 | 2 |
| 2582.0 | 2 |
| 2583.0 | 2 |
| 2584.0 | 2 |
| 2585.0 | 3 |
| 2586.0 | 1 |
| 2587.0 | 1 |
| 2588.0 | 2 |
| 2589.0 | 3 |
| 2590.0 | 1 |
| 2591.0 | 1 |
| 2592.0 | 2 |
| 2593.0 | 2 |
| 2594.0 | 2 |
| 2595.0 | 2 |
| 2596.0 | 2 |
| 2597.0 | 3 |
| 2598.0 | 1 |
| 2599.0 | 2 |
| 2600.0 | 2 |
| 2601.0 | 3 |
| 2602.0 | 1 |
| 2603.0 | 2 |
| 2604.0 | 2 |
| 2605.0 | 2 |
| 2606.0 | 2 |
| 2607.0 | 2 |
| 2608.0 | 2 |
| 2609.0 | 3 |
| 2610.0 | 1 |
| 2611.0 | 1 |
| 2612.0 | 2 |
| 2613.0 | 2 |
| 2614.0 | 2 |
| 2615.0 | 2 |
| 2616.0 | 2 |
| 2617.0 | 3 |
| 2618.0 | 1 |
| 2619.0 | 2 |
| 2620.0 | 3 |
| 2621.0 | 1 |
| 2622.0 | 2 |
| 2623.0 | 2 |
| 2624.0 | 2 |
| 2625.0 | 2 |
| 2626.0 | 2 |
| 2627.0 | 3 |
| 2628.0 | 1 |
| 2629.0 | 1 |
| 2630.0 | 2 |
| 2631.0 | 2 |
| 2632.0 | 2 |
| 2633.0 | 3 |
| 2634.0 | 2 |
| 2635.0 | 2 |
| 2636.0 | 2 |
| 2637.0 | 2 |
| 2638.0 | 3 |
| 2639.0 | 1 |
| 2640.0 | 2 |
| 2641.0 | 2 |
| 2642.0 | 2 |
| 2643.0 | 3 |
| 2644.0 | 1 |
| 2645.0 | 2 |
| 2646.0 | 2 |
| 2647.0 | 2 |
| 2648.0 | 3 |
| 2649.0 | 1 |
| 2650.0 | 1 |
| 2651.0 | 2 |
| 2652.0 | 2 |
| 2653.0 | 2 |
| 2654.0 | 2 |
| 2655.0 | 2 |
| 2656.0 | 2 |
| 2657.0 | 2 |
| 2658.0 | 2 |
| 2659.0 | 2 |
| 2660.0 | 2 |
| 2661.0 | 3 |
| 2662.0 | 1 |
| 2663.0 | 2 |
| 2664.0 | 2 |
| 2665.0 | 3 |
| 2666.0 | 1 |
| 2667.0 | 2 |
| 2668.0 | 2 |
| 2669.0 | 2 |
| 2670.0 | 2 |
| 2671.0 | 2 |
| 2672.0 | 2 |
| 2673.0 | 2 |
| 2674.0 | 2 |
| 2675.0 | 3 |
| 2676.0 | 1 |
| 2677.0 | 2 |
| 2678.0 | 2 |
| 2679.0 | 2 |
| 2680.0 | 2 |
| 2681.0 | 2 |
| 2682.0 | 2 |
| 2683.0 | 2 |
| 2684.0 | 2 |
| 2685.0 | 2 |
| 2686.0 | 3 |
| 2687.0 | 1 |
| 2688.0 | 1 |
| 2689.0 | 2 |
| 2690.0 | 2 |
| 2691.0 | 2 |
| 2692.0 | 2 |
| 2693.0 | 2 |
| 2694.0 | 2 |
| 2695.0 | 2 |
| 2696.0 | 2 |
| 2697.0 | 2 |
| 2698.0 | 2 |
| 2699.0 | 3 |
| 2700.0 | 1 |
| 2701.0 | 2 |
| 2702.0 | 2 |
| 2703.0 | 3 |
| 2704.0 | 1 |
| 2705.0 | 2 |
| 2706.0 | 3 |
| 2707.0 | 1 |
| 2708.0 | 1 |
| 2709.0 | 2 |
| 2710.0 | 2 |
| 2711.0 | 2 |
| 2712.0 | 2 |
| 2713.0 | 2 |
| 2714.0 | 3 |
| 2715.0 | 1 |
| 2716.0 | 2 |
| 2717.0 | 2 |
| 2718.0 | 2 |
| 2719.0 | 2 |
| 2720.0 | 2 |
| 2721.0 | 2 |
| 2722.0 | 3 |
| 2723.0 | 1 |
| 2724.0 | 2 |
| 2725.0 | 2 |
| 2726.0 | 2 |
| 2727.0 | 2 |
| 2728.0 | 2 |
| 2729.0 | 2 |
| 2730.0 | 3 |
| 2731.0 | 1 |
| 2732.0 | 2 |
| 2733.0 | 2 |
| 2734.0 | 3 |
| 2735.0 | 1 |
| 2736.0 | 2 |
| 2737.0 | 2 |
| 2738.0 | 2 |
| 2739.0 | 2 |
| 2740.0 | 3 |
| 2741.0 | 1 |
| 2742.0 | 2 |
| 2743.0 | 3 |
| 2744.0 | 1 |
| 2745.0 | 2 |
| 2746.0 | 2 |
| 2747.0 | 2 |
| 2748.0 | 3 |
| 2749.0 | 1 |
| 2750.0 | 2 |
| 2751.0 | 2 |
| 2752.0 | 2 |
| 2753.0 | 2 |
| 2754.0 | 3 |
| 2755.0 | 1 |
| 2756.0 | 2 |
| 2757.0 | 3 |
| 2758.0 | 1 |
| 2759.0 | 1 |
| 2760.0 | 1 |
| 2761.0 | 2 |
| 2762.0 | 3 |
| 2763.0 | 1 |
| 2764.0 | 2 |
| 2765.0 | 2 |
| 2766.0 | 2 |
| 2767.0 | 2 |
| 2768.0 | 2 |
| 2769.0 | 3 |
| 2770.0 | 1 |
| 2771.0 | 2 |
| 2772.0 | 2 |
| 2773.0 | 2 |
| 2774.0 | 2 |
| 2775.0 | 3 |
| 2776.0 | 1 |
| 2777.0 | 2 |
| 2778.0 | 2 |
| 2779.0 | 2 |
| 2780.0 | 3 |
| 2781.0 | 1 |
| 2782.0 | 2 |
| 2783.0 | 2 |
| 2784.0 | 3 |
| 2785.0 | 2 |
| 2786.0 | 2 |
| 2787.0 | 3 |
| 2788.0 | 1 |
| 2789.0 | 2 |
| 2790.0 | 2 |
| 2791.0 | 2 |
| 2792.0 | 2 |
| 2793.0 | 2 |
| 2794.0 | 3 |
| 2795.0 | 1 |
| 2796.0 | 2 |
| 2797.0 | 2 |
| 2798.0 | 2 |
| 2799.0 | 2 |
| 2800.0 | 2 |
| 2801.0 | 2 |
| 2802.0 | 2 |
| 2803.0 | 2 |
| 2804.0 | 2 |
| 2805.0 | 2 |
| 2806.0 | 2 |
| 2807.0 | 3 |
| 2808.0 | 1 |
| 2809.0 | 2 |
| 2810.0 | 3 |
| 2811.0 | 1 |
| 2812.0 | 2 |
| 2813.0 | 2 |
| 2814.0 | 3 |
| 2815.0 | 1 |
| 2816.0 | 2 |
| 2817.0 | 2 |
| 2818.0 | 2 |
| 2819.0 | 2 |
| 2820.0 | 3 |
| 2821.0 | 1 |
| 2822.0 | 2 |
| 2823.0 | 2 |
| 2824.0 | 2 |
| 2825.0 | 2 |
| 2826.0 | 2 |
| 2827.0 | 2 |
| 2828.0 | 2 |
| 2829.0 | 2 |
| 2830.0 | 3 |
| 2831.0 | 1 |
| 2832.0 | 1 |
| 2833.0 | 2 |
| 2834.0 | 2 |
| 2835.0 | 2 |
| 2836.0 | 2 |
| 2837.0 | 2 |
| 2838.0 | 2 |
| 2839.0 | 2 |
| 2840.0 | 2 |
| 2841.0 | 2 |
| 2842.0 | 2 |
| 2843.0 | 2 |
| 2844.0 | 2 |
| 2845.0 | 2 |
| 2846.0 | 2 |
| 2847.0 | 2 |
| 2848.0 | 2 |
| 2849.0 | 3 |
| 2850.0 | 1 |
| 2851.0 | 2 |
| 2852.0 | 3 |
| 2853.0 | 2 |
| 2854.0 | 3 |
| 2855.0 | 1 |
| 2856.0 | 1 |
| 2857.0 | 2 |
| 2858.0 | 2 |
| 2859.0 | 2 |
| 2860.0 | 3 |
| 2861.0 | 1 |
| 2862.0 | 2 |
| 2863.0 | 2 |
| 2864.0 | 2 |
| 2865.0 | 3 |
| 2866.0 | 1 |
| 2867.0 | 2 |
| 2868.0 | 2 |
| 2869.0 | 3 |
| 2870.0 | 1 |
| 2871.0 | 2 |
| 2872.0 | 3 |
| 2873.0 | 1 |
| 2874.0 | 2 |
| 2875.0 | 2 |
| 2876.0 | 2 |
| 2877.0 | 2 |
| 2878.0 | 2 |
| 2879.0 | 2 |
| 2880.0 | 2 |
| 2881.0 | 2 |
| 2882.0 | 2 |
| 2883.0 | 3 |
| 2884.0 | 1 |
| 2885.0 | 2 |
| 2886.0 | 2 |
| 2887.0 | 2 |
| 2888.0 | 2 |
| 2889.0 | 2 |
| 2890.0 | 2 |
| 2891.0 | 2 |
| 2892.0 | 2 |
| 2893.0 | 2 |
| 2894.0 | 2 |
| 2895.0 | 2 |
| 2896.0 | 3 |
| 2897.0 | 1 |
| 2898.0 | 1 |
| 2899.0 | 2 |
| 2900.0 | 2 |
| 2901.0 | 2 |
| 2902.0 | 2 |
| 2903.0 | 2 |
| 2904.0 | 2 |
| 2905.0 | 2 |
| 2906.0 | 2 |
| 2907.0 | 3 |
| 2908.0 | 1 |
| 2909.0 | 2 |
| 2910.0 | 2 |
| 2911.0 | 3 |
| 2912.0 | 1 |
| 2913.0 | 2 |
| 2914.0 | 2 |
| 2915.0 | 2 |
| 2916.0 | 2 |
| 2917.0 | 2 |
| 2918.0 | 2 |
| 2919.0 | 2 |
| 2920.0 | 2 |
| 2921.0 | 3 |
| 2922.0 | 1 |
| 2923.0 | 2 |
| 2924.0 | 2 |
| 2925.0 | 2 |
| 2926.0 | 2 |
| 2927.0 | 2 |
| 2928.0 | 2 |
| 2929.0 | 2 |
| 2930.0 | 3 |
| 2931.0 | 1 |
| 2932.0 | 2 |
| 2933.0 | 2 |
| 2934.0 | 2 |
| 2935.0 | 3 |
| 2936.0 | 2 |
| 2937.0 | 3 |
| 2938.0 | 1 |
| 2939.0 | 2 |
| 2940.0 | 2 |
| 2941.0 | 2 |
| 2942.0 | 3 |
| 2943.0 | 1 |
| 2944.0 | 2 |
| 2945.0 | 2 |
| 2946.0 | 3 |
| 2947.0 | 1 |
| 2948.0 | 2 |
| 2949.0 | 2 |
| 2950.0 | 2 |
| 2951.0 | 2 |
| 2952.0 | 2 |
| 2953.0 | 3 |
| 2954.0 | 1 |
| 2955.0 | 2 |
| 2956.0 | 2 |
| 2957.0 | 2 |
| 2958.0 | 2 |
| 2959.0 | 2 |
| 2960.0 | 3 |
| 2961.0 | 1 |
| 2962.0 | 2 |
| 2963.0 | 2 |
| 2964.0 | 2 |
| 2965.0 | 2 |
| 2966.0 | 3 |
| 2967.0 | 1 |
| 2968.0 | 1 |
| 2969.0 | 1 |
| 2970.0 | 1 |
| 2971.0 | 1 |
| 2972.0 | 2 |
| 2973.0 | 2 |
| 2974.0 | 3 |
| 2975.0 | 1 |
| 2976.0 | 2 |
| 2977.0 | 2 |
| 2978.0 | 3 |
| 2979.0 | 1 |
| 2980.0 | 2 |
| 2981.0 | 2 |
| 2982.0 | 2 |
| 2983.0 | 2 |
| 2984.0 | 2 |
| 2985.0 | 2 |
| 2986.0 | 3 |
| 2987.0 | 1 |
| 2988.0 | 2 |
| 2989.0 | 3 |
| 2990.0 | 1 |
| 2991.0 | 1 |
| 2992.0 | 2 |
| 2993.0 | 3 |
| 2994.0 | 1 |
| 2995.0 | 2 |
| 2996.0 | 2 |
| 2997.0 | 2 |
| 2998.0 | 3 |
| 2999.0 | 1 |
| 3000.0 | 2 |
| 3001.0 | 2 |
| 3002.0 | 2 |
| 3003.0 | 2 |
| 3004.0 | 2 |
| 3005.0 | 2 |
| 3006.0 | 2 |
| 3007.0 | 3 |
| 3008.0 | 1 |
| 3009.0 | 2 |
| 3010.0 | 2 |
| 3011.0 | 2 |
| 3012.0 | 2 |
| 3013.0 | 2 |
| 3014.0 | 3 |
| 3015.0 | 1 |
| 3016.0 | 2 |
| 3017.0 | 2 |
| 3018.0 | 2 |
| 3019.0 | 2 |
| 3020.0 | 2 |
| 3021.0 | 3 |
| 3022.0 | 1 |
| 3023.0 | 1 |
| 3024.0 | 2 |
| 3025.0 | 2 |
| 3026.0 | 2 |
| 3027.0 | 2 |
| 3028.0 | 3 |
| 3029.0 | 2 |
| 3030.0 | 3 |
| 3031.0 | 1 |
| 3032.0 | 2 |
| 3033.0 | 2 |
| 3034.0 | 2 |
| 3035.0 | 3 |
| 3036.0 | 1 |
| 3037.0 | 1 |
| 3038.0 | 1 |
| 3039.0 | 2 |
| 3040.0 | 2 |
| 3041.0 | 2 |
| 3042.0 | 2 |
| 3043.0 | 2 |
| 3044.0 | 2 |
| 3045.0 | 3 |
| 3046.0 | 1 |
| 3047.0 | 2 |
| 3048.0 | 2 |
| 3049.0 | 2 |
| 3050.0 | 3 |
| 3051.0 | 2 |
| 3052.0 | 2 |
| 3053.0 | 3 |
| 3054.0 | 2 |
| 3055.0 | 2 |
| 3056.0 | 2 |
| 3057.0 | 2 |
| 3058.0 | 3 |
| 3059.0 | 1 |
| 3060.0 | 2 |
| 3061.0 | 3 |
| 3062.0 | 1 |
| 3063.0 | 2 |
| 3064.0 | 2 |
| 3065.0 | 3 |
| 3066.0 | 1 |
| 3067.0 | 2 |
| 3068.0 | 2 |
| 3069.0 | 2 |
| 3070.0 | 2 |
| 3071.0 | 2 |
| 3072.0 | 2 |
| 3073.0 | 2 |
| 3074.0 | 2 |
| 3075.0 | 2 |
| 3076.0 | 2 |
| 3077.0 | 2 |
| 3078.0 | 2 |
| 3079.0 | 3 |
| 3080.0 | 1 |
| 3081.0 | 2 |
| 3082.0 | 2 |
| 3083.0 | 2 |
| 3084.0 | 2 |
| 3085.0 | 3 |
| 3086.0 | 1 |
| 3087.0 | 2 |
| 3088.0 | 2 |
| 3089.0 | 2 |
| 3090.0 | 3 |
| 3091.0 | 1 |
| 3092.0 | 1 |
| 3093.0 | 2 |
| 3094.0 | 2 |
| 3095.0 | 2 |
| 3096.0 | 2 |
| 3097.0 | 2 |
| 3098.0 | 2 |
| 3099.0 | 2 |
| 3100.0 | 2 |
| 3101.0 | 2 |
| 3102.0 | 2 |
| 3103.0 | 2 |
| 3104.0 | 2 |
| 3105.0 | 3 |
| 3106.0 | 1 |
| 3107.0 | 2 |
| 3108.0 | 2 |
| 3109.0 | 2 |
| 3110.0 | 3 |
| 3111.0 | 1 |
| 3112.0 | 2 |
| 3113.0 | 2 |
| 3114.0 | 3 |
| 3115.0 | 1 |
| 3116.0 | 2 |
| 3117.0 | 3 |
| 3118.0 | 1 |
| 3119.0 | 2 |
| 3120.0 | 2 |
| 3121.0 | 2 |
| 3122.0 | 3 |
| 3123.0 | 1 |
| 3124.0 | 2 |
| 3125.0 | 3 |
| 3126.0 | 2 |
| 3127.0 | 2 |
| 3128.0 | 3 |
| 3129.0 | 1 |
| 3130.0 | 2 |
| 3131.0 | 3 |
| 3132.0 | 1 |
| 3133.0 | 2 |
| 3134.0 | 2 |
| 3135.0 | 2 |
| 3136.0 | 2 |
| 3137.0 | 2 |
| 3138.0 | 2 |
| 3139.0 | 2 |
| 3140.0 | 2 |
| 3141.0 | 3 |
| 3142.0 | 1 |
| 3143.0 | 2 |
| 3144.0 | 2 |
| 3145.0 | 2 |
| 3146.0 | 2 |
| 3147.0 | 3 |
| 3148.0 | 1 |
| 3149.0 | 2 |
| 3150.0 | 2 |
| 3151.0 | 2 |
| 3152.0 | 2 |
| 3153.0 | 2 |
| 3154.0 | 2 |
| 3155.0 | 2 |
| 3156.0 | 2 |
| 3157.0 | 2 |
| 3158.0 | 3 |
| 3159.0 | 1 |
| 3160.0 | 2 |
| 3161.0 | 3 |
| 3162.0 | 1 |
| 3163.0 | 2 |
| 3164.0 | 2 |
| 3165.0 | 2 |
| 3166.0 | 2 |
| 3167.0 | 2 |
| 3168.0 | 3 |
| 3169.0 | 1 |
| 3170.0 | 2 |
| 3171.0 | 2 |
| 3172.0 | 2 |
| 3173.0 | 2 |
| 3174.0 | 2 |
| 3175.0 | 2 |
| 3176.0 | 2 |
| 3177.0 | 2 |
| 3178.0 | 2 |
| 3179.0 | 2 |
| 3180.0 | 2 |
| 3181.0 | 2 |
| 3182.0 | 2 |
| 3183.0 | 2 |
| 3184.0 | 2 |
| 3185.0 | 2 |
| 3186.0 | 2 |
| 3187.0 | 2 |
| 3188.0 | 2 |
| 3189.0 | 2 |
| 3190.0 | 2 |
| 3191.0 | 2 |
| 3192.0 | 2 |
| 3193.0 | 2 |
| 3194.0 | 2 |
| 3195.0 | 2 |
| 3196.0 | 2 |
| 3197.0 | 2 |
| 3198.0 | 2 |
| 3199.0 | 2 |
| 3200.0 | 2 |
| 3201.0 | 2 |
| 3202.0 | 2 |
| 3203.0 | 3 |
| 3204.0 | 1 |
| 3205.0 | 2 |
| 3206.0 | 2 |
| 3207.0 | 3 |
| 3208.0 | 1 |
| 3209.0 | 1 |
| 3210.0 | 2 |
| 3211.0 | 2 |
| 3212.0 | 2 |
| 3213.0 | 3 |
| 3214.0 | 2 |
| 3215.0 | 3 |
| 3216.0 | 1 |
| 3217.0 | 1 |
| 3218.0 | 2 |
| 3219.0 | 3 |
| 3220.0 | 1 |
| 3221.0 | 1 |
| 3222.0 | 2 |
| 3223.0 | 3 |
| 3224.0 | 1 |
| 3225.0 | 1 |
| 3226.0 | 1 |
| 3227.0 | 2 |
| 3228.0 | 3 |
| 3229.0 | 1 |
| 3230.0 | 2 |
| 3231.0 | 2 |
| 3232.0 | 2 |
| 3233.0 | 2 |
| 3234.0 | 3 |
| 3235.0 | 2 |
| 3236.0 | 2 |
| 3237.0 | 2 |
| 3238.0 | 2 |
| 3239.0 | 2 |
| 3240.0 | 3 |
| 3241.0 | 1 |
| 3242.0 | 2 |
| 3243.0 | 2 |
| 3244.0 | 2 |
| 3245.0 | 2 |
| 3246.0 | 2 |
| 3247.0 | 2 |
| 3248.0 | 2 |
| 3249.0 | 2 |
| 3250.0 | 2 |
| 3251.0 | 2 |
| 3252.0 | 2 |
| 3253.0 | 2 |
| 3254.0 | 3 |
| 3255.0 | 2 |
| 3256.0 | 2 |
| 3257.0 | 3 |
| 3258.0 | 1 |
| 3259.0 | 2 |
| 3260.0 | 2 |
| 3261.0 | 3 |
| 3262.0 | 1 |
| 3263.0 | 1 |
| 3264.0 | 1 |
| 3265.0 | 2 |
| 3266.0 | 3 |
| 3267.0 | 1 |
| 3268.0 | 2 |
| 3269.0 | 2 |
| 3270.0 | 2 |
| 3271.0 | 2 |
| 3272.0 | 2 |
| 3273.0 | 2 |
| 3274.0 | 2 |
| 3275.0 | 2 |
| 3276.0 | 3 |
| 3277.0 | 1 |
| 3278.0 | 1 |
| 3279.0 | 1 |
| 3280.0 | 1 |
| 3281.0 | 2 |
| 3282.0 | 2 |
| 3283.0 | 3 |
| 3284.0 | 1 |
| 3285.0 | 2 |
| 3286.0 | 2 |
| 3287.0 | 2 |
| 3288.0 | 2 |
| 3289.0 | 2 |
| 3290.0 | 2 |
| 3291.0 | 2 |
| 3292.0 | 2 |
| 3293.0 | 2 |
| 3294.0 | 2 |
| 3295.0 | 2 |
| 3296.0 | 2 |
| 3297.0 | 2 |
| 3298.0 | 2 |
| 3299.0 | 2 |
| 3300.0 | 2 |
| 3301.0 | 3 |
| 3302.0 | 2 |
| 3303.0 | 3 |
| 3304.0 | 1 |
| 3305.0 | 1 |
| 3306.0 | 2 |
| 3307.0 | 2 |
| 3308.0 | 2 |
| 3309.0 | 2 |
| 3310.0 | 2 |
| 3311.0 | 2 |
| 3312.0 | 3 |
| 3313.0 | 1 |
| 3314.0 | 2 |
| 3315.0 | 2 |
| 3316.0 | 2 |
| 3317.0 | 2 |
| 3318.0 | 2 |
| 3319.0 | 2 |
| 3320.0 | 3 |
| 3321.0 | 1 |
| 3322.0 | 1 |
| 3323.0 | 1 |
| 3324.0 | 2 |
| 3325.0 | 2 |
| 3326.0 | 2 |
| 3327.0 | 2 |
| 3328.0 | 3 |
| 3329.0 | 1 |
| 3330.0 | 2 |
| 3331.0 | 2 |
| 3332.0 | 2 |
| 3333.0 | 2 |
| 3334.0 | 3 |
| 3335.0 | 1 |
| 3336.0 | 2 |
| 3337.0 | 3 |
| 3338.0 | 1 |
| 3339.0 | 2 |
| 3340.0 | 2 |
| 3341.0 | 2 |
| 3342.0 | 2 |
| 3343.0 | 2 |
| 3344.0 | 2 |
| 3345.0 | 2 |
| 3346.0 | 2 |
| 3347.0 | 2 |
| 3348.0 | 3 |
| 3349.0 | 1 |
| 3350.0 | 2 |
| 3351.0 | 2 |
| 3352.0 | 3 |
| 3353.0 | 1 |
| 3354.0 | 1 |
| 3355.0 | 2 |
| 3356.0 | 2 |
| 3357.0 | 2 |
| 3358.0 | 2 |
| 3359.0 | 3 |
| 3360.0 | 1 |
| 3361.0 | 2 |
| 3362.0 | 3 |
| 3363.0 | 1 |
| 3364.0 | 2 |
| 3365.0 | 2 |
| 3366.0 | 2 |
| 3367.0 | 2 |
| 3368.0 | 3 |
| 3369.0 | 2 |
| 3370.0 | 2 |
| 3371.0 | 3 |
| 3372.0 | 1 |
| 3373.0 | 2 |
| 3374.0 | 2 |
| 3375.0 | 2 |
| 3376.0 | 2 |
| 3377.0 | 2 |
| 3378.0 | 2 |
| 3379.0 | 2 |
| 3380.0 | 2 |
| 3381.0 | 2 |
| 3382.0 | 2 |
| 3383.0 | 2 |
| 3384.0 | 2 |
| 3385.0 | 2 |
| 3386.0 | 3 |
| 3387.0 | 2 |
| 3388.0 | 2 |
| 3389.0 | 2 |
| 3390.0 | 2 |
| 3391.0 | 2 |
| 3392.0 | 2 |
| 3393.0 | 2 |
| 3394.0 | 3 |
| 3395.0 | 1 |
| 3396.0 | 1 |
| 3397.0 | 2 |
| 3398.0 | 2 |
| 3399.0 | 2 |
| 3400.0 | 2 |
| 3401.0 | 2 |
| 3402.0 | 2 |
| 3403.0 | 2 |
| 3404.0 | 2 |
| 3405.0 | 2 |
| 3406.0 | 2 |
| 3407.0 | 2 |
| 3408.0 | 3 |
| 3409.0 | 1 |
| 3410.0 | 2 |
| 3411.0 | 3 |
| 3412.0 | 1 |
| 3413.0 | 2 |
| 3414.0 | 2 |
| 3415.0 | 2 |
| 3416.0 | 2 |
| 3417.0 | 2 |
| 3418.0 | 2 |
| 3419.0 | 2 |
| 3420.0 | 2 |
| 3421.0 | 2 |
| 3422.0 | 2 |
| 3423.0 | 2 |
| 3424.0 | 2 |
| 3425.0 | 2 |
| 3426.0 | 3 |
| 3427.0 | 1 |
| 3428.0 | 2 |
| 3429.0 | 2 |
| 3430.0 | 2 |
| 3431.0 | 3 |
| 3432.0 | 2 |
| 3433.0 | 2 |
| 3434.0 | 2 |
| 3435.0 | 2 |
| 3436.0 | 2 |
| 3437.0 | 3 |
| 3438.0 | 1 |
| 3439.0 | 2 |
| 3440.0 | 3 |
| 3441.0 | 1 |
| 3442.0 | 2 |
| 3443.0 | 2 |
| 3444.0 | 3 |
| 3445.0 | 1 |
| 3446.0 | 2 |
| 3447.0 | 3 |
| 3448.0 | 2 |
| 3449.0 | 2 |
| 3450.0 | 3 |
| 3451.0 | 1 |
| 3452.0 | 2 |
| 3453.0 | 2 |
| 3454.0 | 2 |
| 3455.0 | 2 |
| 3456.0 | 3 |
| 3457.0 | 1 |
| 3458.0 | 2 |
| 3459.0 | 2 |
| 3460.0 | 2 |
| 3461.0 | 3 |
| 3462.0 | 1 |
| 3463.0 | 2 |
| 3464.0 | 2 |
| 3465.0 | 2 |
| 3466.0 | 2 |
| 3467.0 | 3 |
| 3468.0 | 1 |
| 3469.0 | 2 |
| 3470.0 | 2 |
| 3471.0 | 2 |
| 3472.0 | 2 |
| 3473.0 | 2 |
| 3474.0 | 2 |
| 3475.0 | 2 |
| 3476.0 | 2 |
| 3477.0 | 2 |
| 3478.0 | 2 |
| 3479.0 | 2 |
| 3480.0 | 3 |
| 3481.0 | 1 |
| 3482.0 | 2 |
| 3483.0 | 2 |
| 3484.0 | 2 |
| 3485.0 | 2 |
| 3486.0 | 2 |
| 3487.0 | 2 |
| 3488.0 | 2 |
| 3489.0 | 2 |
| 3490.0 | 2 |
| 3491.0 | 3 |
| 3492.0 | 1 |
| 3493.0 | 2 |
| 3494.0 | 2 |
| 3495.0 | 2 |
| 3496.0 | 2 |
| 3497.0 | 2 |
| 3498.0 | 2 |
| 3499.0 | 3 |
| 3500.0 | 1 |
| 3501.0 | 2 |
| 3502.0 | 2 |
| 3503.0 | 2 |
| 3504.0 | 2 |
| 3505.0 | 2 |
| 3506.0 | 2 |
| 3507.0 | 2 |
| 3508.0 | 2 |
| 3509.0 | 2 |
| 3510.0 | 2 |
| 3511.0 | 2 |
| 3512.0 | 2 |
| 3513.0 | 2 |
| 3514.0 | 2 |
| 3515.0 | 2 |
| 3516.0 | 3 |
| 3517.0 | 1 |
| 3518.0 | 1 |
| 3519.0 | 1 |
| 3520.0 | 2 |
| 3521.0 | 3 |
| 3522.0 | 1 |
| 3523.0 | 2 |
| 3524.0 | 2 |
| 3525.0 | 2 |
| 3526.0 | 2 |
| 3527.0 | 2 |
| 3528.0 | 2 |
| 3529.0 | 2 |
| 3530.0 | 3 |
| 3531.0 | 2 |
| 3532.0 | 2 |
| 3533.0 | 2 |
| 3534.0 | 2 |
| 3535.0 | 2 |
| 3536.0 | 2 |
| 3537.0 | 2 |
| 3538.0 | 2 |
| 3539.0 | 3 |
| 3540.0 | 1 |
| 3541.0 | 2 |
| 3542.0 | 2 |
| 3543.0 | 2 |
| 3544.0 | 2 |
| 3545.0 | 3 |
| 3546.0 | 1 |
| 3547.0 | 1 |
| 3548.0 | 2 |
| 3549.0 | 2 |
| 3550.0 | 3 |
| 3551.0 | 1 |
| 3552.0 | 2 |
| 3553.0 | 3 |
| 3554.0 | 1 |
| 3555.0 | 2 |
| 3556.0 | 2 |
| 3557.0 | 3 |
| 3558.0 | 1 |
| 3559.0 | 2 |
| 3560.0 | 2 |
| 3561.0 | 2 |
| 3562.0 | 2 |
| 3563.0 | 2 |
| 3564.0 | 2 |
| 3565.0 | 2 |
| 3566.0 | 2 |
| 3567.0 | 2 |
| 3568.0 | 3 |
| 3569.0 | 1 |
| 3570.0 | 2 |
| 3571.0 | 2 |
| 3572.0 | 2 |
| 3573.0 | 2 |
| 3574.0 | 2 |
| 3575.0 | 2 |
| 3576.0 | 2 |
| 3577.0 | 2 |
| 3578.0 | 2 |
| 3579.0 | 2 |
| 3580.0 | 2 |
| 3581.0 | 3 |
| 3582.0 | 2 |
| 3583.0 | 2 |
| 3584.0 | 2 |
| 3585.0 | 2 |
| 3586.0 | 2 |
| 3587.0 | 2 |
| 3588.0 | 2 |
| 3589.0 | 3 |
| 3590.0 | 1 |
| 3591.0 | 2 |
| 3592.0 | 2 |
| 3593.0 | 2 |
| 3594.0 | 2 |
| 3595.0 | 3 |
| 3596.0 | 1 |
| 3597.0 | 2 |
| 3598.0 | 2 |
| 3599.0 | 3 |
| 3600.0 | 1 |
| 3601.0 | 2 |
| 3602.0 | 3 |
| 3603.0 | 1 |
| 3604.0 | 2 |
| 3605.0 | 3 |
| 3606.0 | 1 |
| 3607.0 | 2 |
| 3608.0 | 2 |
| 3609.0 | 2 |
| 3610.0 | 3 |
| 3611.0 | 1 |
| 3612.0 | 2 |
| 3613.0 | 2 |
| 3614.0 | 3 |
| 3615.0 | 1 |
| 3616.0 | 2 |
| 3617.0 | 2 |
| 3618.0 | 2 |
| 3619.0 | 2 |
| 3620.0 | 2 |
| 3621.0 | 3 |
| 3622.0 | 1 |
| 3623.0 | 1 |
| 3624.0 | 2 |
| 3625.0 | 2 |
| 3626.0 | 2 |
| 3627.0 | 2 |
| 3628.0 | 2 |
| 3629.0 | 2 |
| 3630.0 | 3 |
| 3631.0 | 1 |
| 3632.0 | 2 |
| 3633.0 | 2 |
| 3634.0 | 2 |
| 3635.0 | 2 |
| 3636.0 | 2 |
| 3637.0 | 2 |
| 3638.0 | 2 |
| 3639.0 | 2 |
| 3640.0 | 2 |
| 3641.0 | 2 |
| 3642.0 | 2 |
| 3643.0 | 3 |
| 3644.0 | 1 |
| 3645.0 | 2 |
| 3646.0 | 2 |
| 3647.0 | 2 |
| 3648.0 | 2 |
| 3649.0 | 2 |
| 3650.0 | 2 |
| 3651.0 | 3 |
| 3652.0 | 1 |
| 3653.0 | 2 |
| 3654.0 | 2 |
| 3655.0 | 3 |
| 3656.0 | 1 |
| 3657.0 | 2 |
| 3658.0 | 2 |
| 3659.0 | 2 |
| 3660.0 | 2 |
| 3661.0 | 2 |
| 3662.0 | 3 |
| 3663.0 | 1 |
| 3664.0 | 2 |
| 3665.0 | 2 |
| 3666.0 | 3 |
| 3667.0 | 1 |
| 3668.0 | 2 |
| 3669.0 | 3 |
| 3670.0 | 1 |
| 3671.0 | 1 |
| 3672.0 | 2 |
| 3673.0 | 2 |
| 3674.0 | 3 |
| 3675.0 | 1 |
| 3676.0 | 2 |
| 3677.0 | 2 |
| 3678.0 | 2 |
| 3679.0 | 2 |
| 3680.0 | 2 |
| 3681.0 | 2 |
| 3682.0 | 3 |
| 3683.0 | 1 |
| 3684.0 | 2 |
| 3685.0 | 2 |
| 3686.0 | 2 |
| 3687.0 | 3 |
| 3688.0 | 1 |
| 3689.0 | 2 |
| 3690.0 | 2 |
| 3691.0 | 2 |
| 3692.0 | 3 |
| 3693.0 | 2 |
| 3694.0 | 2 |
| 3695.0 | 2 |
| 3696.0 | 2 |
| 3697.0 | 2 |
| 3698.0 | 2 |
| 3699.0 | 2 |
| 3700.0 | 2 |
| 3701.0 | 2 |
| 3702.0 | 2 |
| 3703.0 | 2 |
| 3704.0 | 3 |
| 3705.0 | 1 |
| 3706.0 | 2 |
| 3707.0 | 2 |
| 3708.0 | 3 |
| 3709.0 | 1 |
| 3710.0 | 1 |
| 3711.0 | 2 |
| 3712.0 | 2 |
| 3713.0 | 2 |
| 3714.0 | 2 |
| 3715.0 | 2 |
| 3716.0 | 2 |
| 3717.0 | 2 |
| 3718.0 | 2 |
| 3719.0 | 2 |
| 3720.0 | 2 |
| 3721.0 | 3 |
| 3722.0 | 1 |
| 3723.0 | 1 |
| 3724.0 | 1 |
| 3725.0 | 2 |
| 3726.0 | 2 |
| 3727.0 | 3 |
| 3728.0 | 1 |
| 3729.0 | 1 |
| 3730.0 | 1 |
| 3731.0 | 2 |
| 3732.0 | 2 |
| 3733.0 | 2 |
| 3734.0 | 2 |
| 3735.0 | 2 |
| 3736.0 | 3 |
| 3737.0 | 1 |
| 3738.0 | 1 |
| 3739.0 | 2 |
| 3740.0 | 2 |
| 3741.0 | 2 |
| 3742.0 | 2 |
| 3743.0 | 2 |
| 3744.0 | 2 |
| 3745.0 | 2 |
| 3746.0 | 3 |
| 3747.0 | 1 |
| 3748.0 | 2 |
| 3749.0 | 2 |
| 3750.0 | 2 |
| 3751.0 | 2 |
| 3752.0 | 2 |
| 3753.0 | 2 |
| 3754.0 | 2 |
| 3755.0 | 3 |
| 3756.0 | 2 |
| 3757.0 | 2 |
| 3758.0 | 2 |
| 3759.0 | 2 |
| 3760.0 | 2 |
| 3761.0 | 2 |
| 3762.0 | 2 |
| 3763.0 | 2 |
| 3764.0 | 2 |
| 3765.0 | 2 |
| 3766.0 | 2 |
| 3767.0 | 2 |
| 3768.0 | 2 |
| 3769.0 | 3 |
| 3770.0 | 1 |
| 3771.0 | 2 |
| 3772.0 | 2 |
| 3773.0 | 3 |
| 3774.0 | 1 |
| 3775.0 | 1 |
| 3776.0 | 2 |
| 3777.0 | 2 |
| 3778.0 | 2 |
| 3779.0 | 2 |
| 3780.0 | 2 |
| 3781.0 | 2 |
| 3782.0 | 2 |
| 3783.0 | 2 |
| 3784.0 | 2 |
| 3785.0 | 2 |
| 3786.0 | 2 |
| 3787.0 | 2 |
| 3788.0 | 2 |
| 3789.0 | 2 |
| 3790.0 | 2 |
| 3791.0 | 2 |
| 3792.0 | 2 |
| 3793.0 | 2 |
| 3794.0 | 2 |
| 3795.0 | 3 |
| 3796.0 | 1 |
| 3797.0 | 2 |
| 3798.0 | 2 |
| 3799.0 | 2 |
| 3800.0 | 2 |
| 3801.0 | 2 |
| 3802.0 | 2 |
| 3803.0 | 2 |
| 3804.0 | 2 |
| 3805.0 | 2 |
| 3806.0 | 2 |
| 3807.0 | 2 |
| 3808.0 | 2 |
| 3809.0 | 3 |
| 3810.0 | 1 |
| 3811.0 | 2 |
| 3812.0 | 2 |
| 3813.0 | 2 |
| 3814.0 | 3 |
| 3815.0 | 1 |
| 3816.0 | 2 |
| 3817.0 | 2 |
| 3818.0 | 2 |
| 3819.0 | 2 |
| 3820.0 | 3 |
| 3821.0 | 1 |
| 3822.0 | 2 |
| 3823.0 | 2 |
| 3824.0 | 2 |
| 3825.0 | 2 |
| 3826.0 | 2 |
| 3827.0 | 2 |
| 3828.0 | 2 |
| 3829.0 | 2 |
| 3830.0 | 2 |
| 3831.0 | 2 |
| 3832.0 | 2 |
| 3833.0 | 3 |
| 3834.0 | 1 |
| 3835.0 | 2 |
| 3836.0 | 2 |
| 3837.0 | 2 |
| 3838.0 | 2 |
| 3839.0 | 3 |
| 3840.0 | 1 |
| 3841.0 | 2 |
| 3842.0 | 2 |
| 3843.0 | 2 |
| 3844.0 | 2 |
| 3845.0 | 2 |
| 3846.0 | 2 |
| 3847.0 | 2 |
| 3848.0 | 2 |
| 3849.0 | 2 |
| 3850.0 | 2 |
| 3851.0 | 2 |
| 3852.0 | 2 |
| 3853.0 | 2 |
| 3854.0 | 2 |
| 3855.0 | 2 |
| 3856.0 | 2 |
| 3857.0 | 3 |
| 3858.0 | 1 |
| 3859.0 | 2 |
| 3860.0 | 3 |
| 3861.0 | 1 |
| 3862.0 | 2 |
| 3863.0 | 2 |
| 3864.0 | 2 |
| 3865.0 | 2 |
| 3866.0 | 2 |
| 3867.0 | 2 |
| 3868.0 | 2 |
| 3869.0 | 3 |
| 3870.0 | 1 |
| 3871.0 | 2 |
| 3872.0 | 2 |
| 3873.0 | 2 |
| 3874.0 | 2 |
| 3875.0 | 2 |
| 3876.0 | 3 |
| 3877.0 | 1 |
| 3878.0 | 2 |
| 3879.0 | 2 |
| 3880.0 | 3 |
| 3881.0 | 1 |
| 3882.0 | 2 |
| 3883.0 | 2 |
| 3884.0 | 2 |
| 3885.0 | 2 |
| 3886.0 | 2 |
| 3887.0 | 2 |
| 3888.0 | 2 |
| 3889.0 | 2 |
| 3890.0 | 3 |
| 3891.0 | 1 |
| 3892.0 | 2 |
| 3893.0 | 2 |
| 3894.0 | 2 |
| 3895.0 | 3 |
| 3896.0 | 1 |
| 3897.0 | 2 |
| 3898.0 | 3 |
| 3899.0 | 1 |
| 3900.0 | 1 |
| 3901.0 | 1 |
| 3902.0 | 2 |
| 3903.0 | 2 |
| 3904.0 | 2 |
| 3905.0 | 2 |
| 3906.0 | 2 |
| 3907.0 | 2 |
| 3908.0 | 3 |
| 3909.0 | 1 |
| 3910.0 | 2 |
| 3911.0 | 2 |
| 3912.0 | 2 |
| 3913.0 | 2 |
| 3914.0 | 2 |
| 3915.0 | 2 |
| 3916.0 | 2 |
| 3917.0 | 2 |
| 3918.0 | 3 |
| 3919.0 | 2 |
| 3920.0 | 2 |
| 3921.0 | 3 |
| 3922.0 | 1 |
| 3923.0 | 2 |
| 3924.0 | 2 |
| 3925.0 | 2 |
| 3926.0 | 2 |
| 3927.0 | 2 |
| 3928.0 | 3 |
| 3929.0 | 2 |
| 3930.0 | 2 |
| 3931.0 | 2 |
| 3932.0 | 2 |
| 3933.0 | 2 |
| 3934.0 | 2 |
| 3935.0 | 3 |
| 3936.0 | 1 |
| 3937.0 | 2 |
| 3938.0 | 3 |
| 3939.0 | 1 |
| 3940.0 | 2 |
| 3941.0 | 2 |
| 3942.0 | 2 |
| 3943.0 | 2 |
| 3944.0 | 3 |
| 3945.0 | 1 |
| 3946.0 | 2 |
| 3947.0 | 2 |
| 3948.0 | 2 |
| 3949.0 | 3 |
| 3950.0 | 1 |
| 3951.0 | 2 |
| 3952.0 | 3 |
| 3953.0 | 1 |
| 3954.0 | 2 |
| 3955.0 | 2 |
| 3956.0 | 2 |
| 3957.0 | 2 |
| 3958.0 | 2 |
| 3959.0 | 2 |
| 3960.0 | 2 |
| 3961.0 | 2 |
| 3962.0 | 3 |
| 3963.0 | 1 |
| 3964.0 | 2 |
| 3965.0 | 2 |
| 3966.0 | 2 |
| 3967.0 | 3 |
| 3968.0 | 1 |
| 3969.0 | 2 |
| 3970.0 | 2 |
| 3971.0 | 2 |
| 3972.0 | 3 |
| 3973.0 | 1 |
| 3974.0 | 2 |
| 3975.0 | 2 |
| 3976.0 | 2 |
| 3977.0 | 2 |
| 3978.0 | 2 |
| 3979.0 | 2 |
| 3980.0 | 2 |
| 3981.0 | 2 |
| 3982.0 | 3 |
| 3983.0 | 1 |
| 3984.0 | 2 |
| 3985.0 | 2 |
| 3986.0 | 2 |
| 3987.0 | 2 |
| 3988.0 | 3 |
| 3989.0 | 1 |
| 3990.0 | 2 |
| 3991.0 | 3 |
| 3992.0 | 1 |
| 3993.0 | 2 |
| 3994.0 | 2 |
| 3995.0 | 2 |
| 3996.0 | 2 |
| 3997.0 | 2 |
| 3998.0 | 2 |
| 3999.0 | 2 |
| 4000.0 | 2 |
| 4001.0 | 2 |
| 4002.0 | 2 |
| 4003.0 | 2 |
| 4004.0 | 2 |
| 4005.0 | 2 |
| 4006.0 | 2 |
| 4007.0 | 2 |
| 4008.0 | 2 |
| 4009.0 | 3 |
| 4010.0 | 2 |
| 4011.0 | 3 |
| 4012.0 | 1 |
| 4013.0 | 1 |
| 4014.0 | 2 |
| 4015.0 | 3 |
| 4016.0 | 1 |
| 4017.0 | 1 |
| 4018.0 | 1 |
| 4019.0 | 2 |
| 4020.0 | 2 |
| 4021.0 | 2 |
| 4022.0 | 2 |
| 4023.0 | 2 |
| 4024.0 | 2 |
| 4025.0 | 3 |
| 4026.0 | 1 |
| 4027.0 | 2 |
| 4028.0 | 2 |
| 4029.0 | 2 |
| 4030.0 | 3 |
| 4031.0 | 1 |
| 4032.0 | 2 |
| 4033.0 | 2 |
| 4034.0 | 2 |
| 4035.0 | 2 |
| 4036.0 | 3 |
| 4037.0 | 1 |
| 4038.0 | 2 |
| 4039.0 | 2 |
| 4040.0 | 2 |
| 4041.0 | 2 |
| 4042.0 | 2 |
| 4043.0 | 3 |
| 4044.0 | 1 |
| 4045.0 | 1 |
| 4046.0 | 1 |
| 4047.0 | 2 |
| 4048.0 | 3 |
| 4049.0 | 1 |
| 4050.0 | 2 |
| 4051.0 | 2 |
| 4052.0 | 2 |
| 4053.0 | 2 |
| 4054.0 | 2 |
| 4055.0 | 3 |
| 4056.0 | 1 |
| 4057.0 | 2 |
| 4058.0 | 2 |
| 4059.0 | 2 |
| 4060.0 | 3 |
| 4061.0 | 1 |
| 4062.0 | 2 |
| 4063.0 | 2 |
| 4064.0 | 3 |
| 4065.0 | 1 |
| 4066.0 | 2 |
| 4067.0 | 3 |
| 4068.0 | 1 |
| 4069.0 | 2 |
| 4070.0 | 2 |
| 4071.0 | 2 |
| 4072.0 | 2 |
| 4073.0 | 2 |
| 4074.0 | 2 |
| 4075.0 | 2 |
| 4076.0 | 2 |
| 4077.0 | 2 |
| 4078.0 | 2 |
| 4079.0 | 2 |
| 4080.0 | 2 |
| 4081.0 | 2 |
| 4082.0 | 2 |
| 4083.0 | 2 |
| 4084.0 | 2 |
| 4085.0 | 2 |
| 4086.0 | 2 |
| 4087.0 | 2 |
| 4088.0 | 3 |
| 4089.0 | 1 |
| 4090.0 | 2 |
| 4091.0 | 2 |
| 4092.0 | 2 |
| 4093.0 | 2 |
| 4094.0 | 2 |
| 4095.0 | 3 |
| 4096.0 | 2 |
| 4097.0 | 2 |
| 4098.0 | 2 |
| 4099.0 | 2 |
| 4100.0 | 2 |
| 4101.0 | 2 |
| 4102.0 | 2 |
| 4103.0 | 2 |
| 4104.0 | 2 |
| 4105.0 | 2 |
| 4106.0 | 2 |
| 4107.0 | 2 |
| 4108.0 | 3 |
| 4109.0 | 1 |
| 4110.0 | 1 |
| 4111.0 | 2 |
| 4112.0 | 3 |
| 4113.0 | 1 |
| 4114.0 | 2 |
| 4115.0 | 2 |
| 4116.0 | 2 |
| 4117.0 | 2 |
| 4118.0 | 2 |
| 4119.0 | 2 |
| 4120.0 | 3 |
| 4121.0 | 1 |
| 4122.0 | 1 |
| 4123.0 | 2 |
| 4124.0 | 2 |
| 4125.0 | 2 |
| 4126.0 | 3 |
| 4127.0 | 1 |
| 4128.0 | 2 |
| 4129.0 | 3 |
| 4130.0 | 1 |
| 4131.0 | 2 |
| 4132.0 | 2 |
| 4133.0 | 2 |
| 4134.0 | 3 |
| 4135.0 | 1 |
| 4136.0 | 2 |
| 4137.0 | 2 |
| 4138.0 | 2 |
| 4139.0 | 2 |
| 4140.0 | 2 |
| 4141.0 | 2 |
| 4142.0 | 2 |
| 4143.0 | 2 |
| 4144.0 | 2 |
| 4145.0 | 2 |
| 4146.0 | 2 |
| 4147.0 | 2 |
| 4148.0 | 3 |
| 4149.0 | 1 |
| 4150.0 | 2 |
| 4151.0 | 2 |
| 4152.0 | 2 |
| 4153.0 | 2 |
| 4154.0 | 2 |
| 4155.0 | 2 |
| 4156.0 | 2 |
| 4157.0 | 2 |
| 4158.0 | 3 |
| 4159.0 | 2 |
| 4160.0 | 2 |
| 4161.0 | 2 |
| 4162.0 | 2 |
| 4163.0 | 2 |
| 4164.0 | 2 |
| 4165.0 | 2 |
| 4166.0 | 3 |
| 4167.0 | 1 |
| 4168.0 | 2 |
| 4169.0 | 2 |
| 4170.0 | 2 |
| 4171.0 | 2 |
| 4172.0 | 3 |
| 4173.0 | 1 |
| 4174.0 | 2 |
| 4175.0 | 2 |
| 4176.0 | 2 |
| 4177.0 | 3 |
| 4178.0 | 1 |
| 4179.0 | 2 |
| 4180.0 | 2 |
| 4181.0 | 2 |
| 4182.0 | 3 |
| 4183.0 | 1 |
| 4184.0 | 1 |
| 4185.0 | 2 |
| 4186.0 | 3 |
| 4187.0 | 1 |
| 4188.0 | 2 |
| 4189.0 | 2 |
| 4190.0 | 2 |
| 4191.0 | 2 |
| 4192.0 | 2 |
| 4193.0 | 2 |
| 4194.0 | 3 |
| 4195.0 | 1 |
| 4196.0 | 2 |
| 4197.0 | 2 |
| 4198.0 | 2 |
| 4199.0 | 3 |
| 4200.0 | 1 |
| 4201.0 | 2 |
| 4202.0 | 3 |
| 4203.0 | 1 |
| 4204.0 | 2 |
| 4205.0 | 3 |
| 4206.0 | 1 |
| 4207.0 | 2 |
| 4208.0 | 2 |
| 4209.0 | 2 |
| 4210.0 | 3 |
| 4211.0 | 1 |
| 4212.0 | 2 |
| 4213.0 | 2 |
| 4214.0 | 2 |
| 4215.0 | 3 |
| 4216.0 | 1 |
| 4217.0 | 2 |
| 4218.0 | 3 |
| 4219.0 | 1 |
| 4220.0 | 2 |
| 4221.0 | 2 |
| 4222.0 | 2 |
| 4223.0 | 2 |
| 4224.0 | 2 |
| 4225.0 | 2 |
| 4226.0 | 2 |
| 4227.0 | 2 |
| 4228.0 | 3 |
| 4229.0 | 1 |
| 4230.0 | 1 |
| 4231.0 | 1 |
| 4232.0 | 2 |
| 4233.0 | 2 |
| 4234.0 | 3 |
| 4235.0 | 1 |
| 4236.0 | 2 |
| 4237.0 | 2 |
| 4238.0 | 2 |
| 4239.0 | 2 |
| 4240.0 | 2 |
| 4241.0 | 3 |
| 4242.0 | 1 |
| 4243.0 | 2 |
| 4244.0 | 2 |
| 4245.0 | 2 |
| 4246.0 | 3 |
| 4247.0 | 1 |
| 4248.0 | 2 |
| 4249.0 | 2 |
| 4250.0 | 2 |
| 4251.0 | 2 |
| 4252.0 | 3 |
| 4253.0 | 2 |
| 4254.0 | 3 |
| 4255.0 | 1 |
| 4256.0 | 2 |
| 4257.0 | 2 |
| 4258.0 | 2 |
| 4259.0 | 2 |
| 4260.0 | 2 |
| 4261.0 | 2 |
| 4262.0 | 2 |
| 4263.0 | 2 |
| 4264.0 | 2 |
| 4265.0 | 3 |
| 4266.0 | 1 |
| 4267.0 | 2 |
| 4268.0 | 2 |
| 4269.0 | 3 |
| 4270.0 | 1 |
| 4271.0 | 1 |
| 4272.0 | 2 |
| 4273.0 | 2 |
| 4274.0 | 3 |
| 4275.0 | 1 |
| 4276.0 | 2 |
| 4277.0 | 2 |
| 4278.0 | 2 |
| 4279.0 | 3 |
| 4280.0 | 1 |
| 4281.0 | 2 |
| 4282.0 | 2 |
| 4283.0 | 2 |
| 4284.0 | 2 |
| 4285.0 | 3 |
| 4286.0 | 1 |
| 4287.0 | 2 |
| 4288.0 | 3 |
| 4289.0 | 2 |
| 4290.0 | 3 |
| 4291.0 | 1 |
| 4292.0 | 1 |
| 4293.0 | 2 |
| 4294.0 | 2 |
| 4295.0 | 2 |
| 4296.0 | 2 |
| 4297.0 | 3 |
| 4298.0 | 1 |
| 4299.0 | 2 |
| 4300.0 | 2 |
| 4301.0 | 2 |
| 4302.0 | 2 |
| 4303.0 | 2 |
| 4304.0 | 3 |
| 4305.0 | 1 |
| 4306.0 | 1 |
| 4307.0 | 1 |
| 4308.0 | 2 |
| 4309.0 | 2 |
| 4310.0 | 3 |
| 4311.0 | 2 |
| 4312.0 | 2 |
| 4313.0 | 3 |
| 4314.0 | 1 |
| 4315.0 | 1 |
| 4316.0 | 2 |
| 4317.0 | 2 |
| 4318.0 | 3 |
| 4319.0 | 1 |
| 4320.0 | 2 |
| 4321.0 | 2 |
| 4322.0 | 2 |
| 4323.0 | 2 |
| 4324.0 | 3 |
| 4325.0 | 1 |
| 4326.0 | 2 |
| 4327.0 | 2 |
| 4328.0 | 2 |
| 4329.0 | 2 |
| 4330.0 | 2 |
| 4331.0 | 3 |
| 4332.0 | 1 |
| 4333.0 | 1 |
| 4334.0 | 2 |
| 4335.0 | 2 |
| 4336.0 | 2 |
| 4337.0 | 2 |
| 4338.0 | 2 |
| 4339.0 | 2 |
| 4340.0 | 2 |
| 4341.0 | 3 |
| 4342.0 | 1 |
| 4343.0 | 2 |
| 4344.0 | 2 |
| 4345.0 | 2 |
| 4346.0 | 2 |
| 4347.0 | 3 |
| 4348.0 | 1 |
| 4349.0 | 2 |
| 4350.0 | 2 |
| 4351.0 | 3 |
| 4352.0 | 1 |
| 4353.0 | 2 |
| 4354.0 | 2 |
| 4355.0 | 2 |
| 4356.0 | 2 |
| 4357.0 | 2 |
| 4358.0 | 2 |
| 4359.0 | 2 |
| 4360.0 | 2 |
| 4361.0 | 2 |
| 4362.0 | 2 |
| 4363.0 | 2 |
| 4364.0 | 2 |
| 4365.0 | 2 |
| 4366.0 | 3 |
| 4367.0 | 1 |
| 4368.0 | 2 |
| 4369.0 | 2 |
| 4370.0 | 2 |
| 4371.0 | 2 |
| 4372.0 | 3 |
| 4373.0 | 2 |
| 4374.0 | 2 |
| 4375.0 | 3 |
| 4376.0 | 1 |
| 4377.0 | 2 |
| 4378.0 | 2 |
| 4379.0 | 2 |
| 4380.0 | 2 |
| 4381.0 | 2 |
| 4382.0 | 2 |
| 4383.0 | 2 |
| 4384.0 | 2 |
| 4385.0 | 2 |
| 4386.0 | 2 |
| 4387.0 | 2 |
| 4388.0 | 2 |
| 4389.0 | 2 |
| 4390.0 | 2 |
| 4391.0 | 2 |
| 4392.0 | 2 |
| 4393.0 | 2 |
| 4394.0 | 2 |
| 4395.0 | 3 |
| 4396.0 | 1 |
| 4397.0 | 1 |
| 4398.0 | 2 |
| 4399.0 | 2 |
| 4400.0 | 2 |
| 4401.0 | 2 |
| 4402.0 | 2 |
| 4403.0 | 2 |
| 4404.0 | 2 |
| 4405.0 | 2 |
| 4406.0 | 2 |
| 4407.0 | 3 |
| 4408.0 | 2 |
| 4409.0 | 2 |
| 4410.0 | 2 |
| 4411.0 | 3 |
| 4412.0 | 1 |
| 4413.0 | 2 |
| 4414.0 | 2 |
| 4415.0 | 2 |
| 4416.0 | 3 |
| 4417.0 | 1 |
| 4418.0 | 2 |
| 4419.0 | 2 |
| 4420.0 | 2 |
| 4421.0 | 2 |
| 4422.0 | 2 |
| 4423.0 | 2 |
| 4424.0 | 2 |
| 4425.0 | 2 |
| 4426.0 | 2 |
| 4427.0 | 3 |
| 4428.0 | 1 |
| 4429.0 | 1 |
| 4430.0 | 2 |
| 4431.0 | 2 |
| 4432.0 | 2 |
| 4433.0 | 2 |
| 4434.0 | 2 |
| 4435.0 | 3 |
| 4436.0 | 1 |
| 4437.0 | 1 |
| 4438.0 | 2 |
| 4439.0 | 2 |
| 4440.0 | 2 |
| 4441.0 | 2 |
| 4442.0 | 2 |
| 4443.0 | 2 |
| 4444.0 | 2 |
| 4445.0 | 2 |
| 4446.0 | 2 |
| 4447.0 | 2 |
| 4448.0 | 3 |
| 4449.0 | 1 |
| 4450.0 | 2 |
| 4451.0 | 2 |
| 4452.0 | 2 |
| 4453.0 | 3 |
| 4454.0 | 1 |
| 4455.0 | 2 |
| 4456.0 | 2 |
| 4457.0 | 2 |
| 4458.0 | 2 |
| 4459.0 | 2 |
| 4460.0 | 2 |
| 4461.0 | 2 |
| 4462.0 | 3 |
| 4463.0 | 1 |
| 4464.0 | 2 |
| 4465.0 | 3 |
| 4466.0 | 1 |
| 4467.0 | 1 |
| 4468.0 | 1 |
| 4469.0 | 2 |
| 4470.0 | 3 |
| 4471.0 | 1 |
| 4472.0 | 1 |
| 4473.0 | 2 |
| 4474.0 | 2 |
| 4475.0 | 3 |
| 4476.0 | 1 |
| 4477.0 | 2 |
| 4478.0 | 2 |
| 4479.0 | 2 |
| 4480.0 | 2 |
| 4481.0 | 3 |
| 4482.0 | 1 |
| 4483.0 | 2 |
| 4484.0 | 2 |
| 4485.0 | 3 |
| 4486.0 | 1 |
| 4487.0 | 2 |
| 4488.0 | 2 |
| 4489.0 | 2 |
| 4490.0 | 2 |
| 4491.0 | 3 |
| 4492.0 | 1 |
| 4493.0 | 1 |
| 4494.0 | 2 |
| 4495.0 | 2 |
| 4496.0 | 3 |
| 4497.0 | 1 |
| 4498.0 | 1 |
| 4499.0 | 2 |
| 4500.0 | 2 |
| 4501.0 | 3 |
| 4502.0 | 1 |
| 4503.0 | 2 |
| 4504.0 | 2 |
| 4505.0 | 2 |
| 4506.0 | 2 |
| 4507.0 | 2 |
| 4508.0 | 2 |
| 4509.0 | 3 |
| 4510.0 | 1 |
| 4511.0 | 2 |
| 4512.0 | 2 |
| 4513.0 | 2 |
| 4514.0 | 2 |
| 4515.0 | 2 |
| 4516.0 | 2 |
| 4517.0 | 2 |
| 4518.0 | 2 |
| 4519.0 | 2 |
| 4520.0 | 2 |
| 4521.0 | 3 |
| 4522.0 | 1 |
| 4523.0 | 2 |
| 4524.0 | 3 |
| 4525.0 | 1 |
| 4526.0 | 2 |
| 4527.0 | 2 |
| 4528.0 | 2 |
| 4529.0 | 2 |
| 4530.0 | 2 |
| 4531.0 | 2 |
| 4532.0 | 2 |
| 4533.0 | 2 |
| 4534.0 | 2 |
| 4535.0 | 2 |
| 4536.0 | 2 |
| 4537.0 | 2 |
| 4538.0 | 3 |
| 4539.0 | 1 |
| 4540.0 | 2 |
| 4541.0 | 2 |
| 4542.0 | 3 |
| 4543.0 | 1 |
| 4544.0 | 2 |
| 4545.0 | 2 |
| 4546.0 | 2 |
| 4547.0 | 2 |
| 4548.0 | 3 |
| 4549.0 | 1 |
| 4550.0 | 2 |
| 4551.0 | 3 |
| 4552.0 | 1 |
| 4553.0 | 2 |
| 4554.0 | 2 |
| 4555.0 | 2 |
| 4556.0 | 2 |
| 4557.0 | 2 |
| 4558.0 | 2 |
| 4559.0 | 2 |
| 4560.0 | 3 |
| 4561.0 | 1 |
| 4562.0 | 2 |
| 4563.0 | 3 |
| 4564.0 | 1 |
| 4565.0 | 2 |
| 4566.0 | 2 |
| 4567.0 | 3 |
| 4568.0 | 1 |
| 4569.0 | 1 |
| 4570.0 | 2 |
| 4571.0 | 2 |
| 4572.0 | 2 |
| 4573.0 | 2 |
| 4574.0 | 2 |
| 4575.0 | 2 |
| 4576.0 | 3 |
| 4577.0 | 1 |
| 4578.0 | 2 |
| 4579.0 | 2 |
| 4580.0 | 3 |
| 4581.0 | 1 |
| 4582.0 | 2 |
| 4583.0 | 2 |
| 4584.0 | 3 |
| 4585.0 | 1 |
| 4586.0 | 2 |
| 4587.0 | 2 |
| 4588.0 | 2 |
| 4589.0 | 2 |
| 4590.0 | 2 |
| 4591.0 | 2 |
| 4592.0 | 2 |
| 4593.0 | 2 |
| 4594.0 | 2 |
| 4595.0 | 2 |
| 4596.0 | 2 |
| 4597.0 | 2 |
| 4598.0 | 2 |
| 4599.0 | 2 |
| 4600.0 | 2 |
| 4601.0 | 2 |
| 4602.0 | 3 |
| 4603.0 | 1 |
| 4604.0 | 2 |
| 4605.0 | 2 |
| 4606.0 | 2 |
| 4607.0 | 2 |
| 4608.0 | 2 |
| 4609.0 | 2 |
| 4610.0 | 2 |
| 4611.0 | 2 |
| 4612.0 | 2 |
| 4613.0 | 2 |
| 4614.0 | 2 |
| 4615.0 | 3 |
| 4616.0 | 1 |
| 4617.0 | 1 |
| 4618.0 | 2 |
| 4619.0 | 2 |
| 4620.0 | 3 |
| 4621.0 | 1 |
| 4622.0 | 2 |
| 4623.0 | 2 |
| 4624.0 | 2 |
| 4625.0 | 2 |
| 4626.0 | 3 |
| 4627.0 | 1 |
| 4628.0 | 2 |
| 4629.0 | 2 |
| 4630.0 | 2 |
| 4631.0 | 2 |
| 4632.0 | 2 |
| 4633.0 | 3 |
| 4634.0 | 1 |
| 4635.0 | 2 |
| 4636.0 | 3 |
| 4637.0 | 1 |
| 4638.0 | 2 |
| 4639.0 | 2 |
| 4640.0 | 3 |
| 4641.0 | 1 |
| 4642.0 | 1 |
| 4643.0 | 2 |
| 4644.0 | 2 |
| 4645.0 | 2 |
| 4646.0 | 2 |
| 4647.0 | 2 |
| 4648.0 | 2 |
| 4649.0 | 2 |
| 4650.0 | 2 |
| 4651.0 | 2 |
| 4652.0 | 2 |
| 4653.0 | 2 |
| 4654.0 | 2 |
| 4655.0 | 2 |
| 4656.0 | 3 |
| 4657.0 | 1 |
| 4658.0 | 2 |
| 4659.0 | 3 |
| 4660.0 | 1 |
| 4661.0 | 2 |
| 4662.0 | 2 |
| 4663.0 | 2 |
| 4664.0 | 2 |
| 4665.0 | 2 |
| 4666.0 | 2 |
| 4667.0 | 2 |
| 4668.0 | 2 |
| 4669.0 | 3 |
| 4670.0 | 1 |
| 4671.0 | 2 |
| 4672.0 | 3 |
| 4673.0 | 1 |
| 4674.0 | 1 |
| 4675.0 | 2 |
| 4676.0 | 2 |
| 4677.0 | 2 |
| 4678.0 | 2 |
| 4679.0 | 3 |
| 4680.0 | 1 |
| 4681.0 | 2 |
| 4682.0 | 2 |
| 4683.0 | 2 |
| 4684.0 | 2 |
| 4685.0 | 2 |
| 4686.0 | 2 |
| 4687.0 | 3 |
| 4688.0 | 1 |
| 4689.0 | 1 |
| 4690.0 | 1 |
| 4691.0 | 1 |
| 4692.0 | 2 |
| 4693.0 | 2 |
| 4694.0 | 2 |
| 4695.0 | 3 |
| 4696.0 | 2 |
| 4697.0 | 2 |
| 4698.0 | 2 |
| 4699.0 | 2 |
| 4700.0 | 3 |
| 4701.0 | 1 |
| 4702.0 | 1 |
| 4703.0 | 2 |
| 4704.0 | 3 |
| 4705.0 | 1 |
| 4706.0 | 1 |
| 4707.0 | 2 |
| 4708.0 | 3 |
| 4709.0 | 1 |
| 4710.0 | 2 |
| 4711.0 | 3 |
| 4712.0 | 1 |
| 4713.0 | 2 |
| 4714.0 | 2 |
| 4715.0 | 2 |
| 4716.0 | 2 |
| 4717.0 | 3 |
| 4718.0 | 1 |
| 4719.0 | 2 |
| 4720.0 | 2 |
| 4721.0 | 2 |
| 4722.0 | 2 |
| 4723.0 | 2 |
| 4724.0 | 2 |
| 4725.0 | 2 |
| 4726.0 | 2 |
| 4727.0 | 2 |
| 4728.0 | 3 |
| 4729.0 | 1 |
| 4730.0 | 2 |
| 4731.0 | 2 |
| 4732.0 | 2 |
| 4733.0 | 2 |
| 4734.0 | 2 |
| 4735.0 | 2 |
| 4736.0 | 3 |
| 4737.0 | 1 |
| 4738.0 | 2 |
| 4739.0 | 2 |
| 4740.0 | 2 |
| 4741.0 | 2 |
| 4742.0 | 2 |
| 4743.0 | 2 |
| 4744.0 | 2 |
| 4745.0 | 2 |
| 4746.0 | 3 |
| 4747.0 | 1 |
| 4748.0 | 2 |
| 4749.0 | 2 |
| 4750.0 | 2 |
| 4751.0 | 2 |
| 4752.0 | 2 |
| 4753.0 | 2 |
| 4754.0 | 2 |
| 4755.0 | 2 |
| 4756.0 | 2 |
| 4757.0 | 2 |
| 4758.0 | 2 |
| 4759.0 | 2 |
| 4760.0 | 2 |
| 4761.0 | 2 |
| 4762.0 | 2 |
| 4763.0 | 2 |
| 4764.0 | 2 |
| 4765.0 | 3 |
| 4766.0 | 1 |
| 4767.0 | 2 |
| 4768.0 | 2 |
| 4769.0 | 2 |
| 4770.0 | 2 |
| 4771.0 | 2 |
| 4772.0 | 3 |
| 4773.0 | 1 |
| 4774.0 | 2 |
| 4775.0 | 2 |
| 4776.0 | 2 |
| 4777.0 | 2 |
| 4778.0 | 3 |
| 4779.0 | 1 |
| 4780.0 | 2 |
| 4781.0 | 2 |
| 4782.0 | 2 |
| 4783.0 | 3 |
| 4784.0 | 1 |
| 4785.0 | 1 |
| 4786.0 | 2 |
| 4787.0 | 2 |
| 4788.0 | 2 |
| 4789.0 | 3 |
| 4790.0 | 2 |
| 4791.0 | 2 |
| 4792.0 | 2 |
| 4793.0 | 2 |
| 4794.0 | 3 |
| 4795.0 | 1 |
| 4796.0 | 2 |
| 4797.0 | 2 |
| 4798.0 | 2 |
| 4799.0 | 3 |
| 4800.0 | 1 |
| 4801.0 | 2 |
| 4802.0 | 2 |
| 4803.0 | 2 |
| 4804.0 | 2 |
| 4805.0 | 2 |
| 4806.0 | 2 |
| 4807.0 | 2 |
| 4808.0 | 2 |
| 4809.0 | 2 |
| 4810.0 | 2 |
| 4811.0 | 2 |
| 4812.0 | 3 |
| 4813.0 | 1 |
| 4814.0 | 2 |
| 4815.0 | 2 |
| 4816.0 | 2 |
| 4817.0 | 2 |
| 4818.0 | 2 |
| 4819.0 | 3 |
| 4820.0 | 1 |
| 4821.0 | 2 |
| 4822.0 | 2 |
| 4823.0 | 2 |
| 4824.0 | 3 |
| 4825.0 | 1 |
| 4826.0 | 1 |
| 4827.0 | 2 |
| 4828.0 | 2 |
| 4829.0 | 3 |
| 4830.0 | 1 |
| 4831.0 | 2 |
| 4832.0 | 3 |
| 4833.0 | 1 |
| 4834.0 | 2 |
| 4835.0 | 2 |
| 4836.0 | 2 |
| 4837.0 | 2 |
| 4838.0 | 2 |
| 4839.0 | 2 |
| 4840.0 | 2 |
| 4841.0 | 2 |
| 4842.0 | 2 |
| 4843.0 | 2 |
| 4844.0 | 2 |
| 4845.0 | 2 |
| 4846.0 | 2 |
| 4847.0 | 3 |
| 4848.0 | 1 |
| 4849.0 | 2 |
| 4850.0 | 2 |
| 4851.0 | 2 |
| 4852.0 | 2 |
| 4853.0 | 3 |
| 4854.0 | 1 |
| 4855.0 | 1 |
| 4856.0 | 2 |
| 4857.0 | 2 |
| 4858.0 | 3 |
| 4859.0 | 1 |
| 4860.0 | 2 |
| 4861.0 | 2 |
| 4862.0 | 2 |
| 4863.0 | 2 |
| 4864.0 | 3 |
| 4865.0 | 1 |
| 4866.0 | 2 |
| 4867.0 | 2 |
| 4868.0 | 2 |
| 4869.0 | 3 |
| 4870.0 | 1 |
| 4871.0 | 2 |
| 4872.0 | 2 |
| 4873.0 | 2 |
| 4874.0 | 2 |
| 4875.0 | 2 |
| 4876.0 | 2 |
| 4877.0 | 2 |
| 4878.0 | 3 |
| 4879.0 | 1 |
| 4880.0 | 2 |
| 4881.0 | 2 |
| 4882.0 | 2 |
| 4883.0 | 2 |
| 4884.0 | 2 |
| 4885.0 | 2 |
| 4886.0 | 2 |
| 4887.0 | 3 |
| 4888.0 | 1 |
| 4889.0 | 1 |
| 4890.0 | 2 |
| 4891.0 | 2 |
| 4892.0 | 2 |
| 4893.0 | 2 |
| 4894.0 | 3 |
| 4895.0 | 1 |
| 4896.0 | 2 |
| 4897.0 | 2 |
| 4898.0 | 2 |
| 4899.0 | 2 |
| 4900.0 | 3 |
| 4901.0 | 1 |
| 4902.0 | 2 |
| 4903.0 | 2 |
| 4904.0 | 3 |
| 4905.0 | 1 |
| 4906.0 | 2 |
| 4907.0 | 3 |
| 4908.0 | 2 |
| 4909.0 | 2 |
| 4910.0 | 2 |
| 4911.0 | 3 |
| 4912.0 | 1 |
| 4913.0 | 2 |
| 4914.0 | 2 |
| 4915.0 | 2 |
| 4916.0 | 2 |
| 4917.0 | 3 |
| 4918.0 | 1 |
| 4919.0 | 2 |
| 4920.0 | 2 |
| 4921.0 | 2 |
| 4922.0 | 3 |
| 4923.0 | 1 |
| 4924.0 | 1 |
| 4925.0 | 2 |
| 4926.0 | 3 |
| 4927.0 | 1 |
| 4928.0 | 2 |
| 4929.0 | 2 |
| 4930.0 | 2 |
| 4931.0 | 2 |
| 4932.0 | 2 |
| 4933.0 | 2 |
| 4934.0 | 2 |
| 4935.0 | 2 |
| 4936.0 | 2 |
| 4937.0 | 2 |
| 4938.0 | 2 |
| 4939.0 | 3 |
| 4940.0 | 1 |
| 4941.0 | 2 |
| 4942.0 | 2 |
| 4943.0 | 2 |
| 4944.0 | 2 |
| 4945.0 | 2 |
| 4946.0 | 2 |
| 4947.0 | 2 |
| 4948.0 | 2 |
| 4949.0 | 2 |
| 4950.0 | 2 |
| 4951.0 | 2 |
| 4952.0 | 2 |
| 4953.0 | 2 |
| 4954.0 | 2 |
| 4955.0 | 2 |
| 4956.0 | 2 |
| 4957.0 | 2 |
| 4958.0 | 2 |
| 4959.0 | 2 |
| 4960.0 | 3 |
| 4961.0 | 1 |
| 4962.0 | 1 |
| 4963.0 | 2 |
| 4964.0 | 2 |
| 4965.0 | 2 |
| 4966.0 | 2 |
| 4967.0 | 2 |
| 4968.0 | 2 |
| 4969.0 | 2 |
| 4970.0 | 2 |
| 4971.0 | 2 |
| 4972.0 | 2 |
| 4973.0 | 2 |
| 4974.0 | 2 |
| 4975.0 | 2 |
| 4976.0 | 2 |
| 4977.0 | 2 |
| 4978.0 | 2 |
| 4979.0 | 2 |
| 4980.0 | 3 |
| 4981.0 | 1 |
| 4982.0 | 2 |
| 4983.0 | 3 |
| 4984.0 | 1 |
| 4985.0 | 2 |
| 4986.0 | 2 |
| 4987.0 | 3 |
| 4988.0 | 1 |
| 4989.0 | 2 |
| 4990.0 | 2 |
| 4991.0 | 2 |
| 4992.0 | 2 |
| 4993.0 | 2 |
| 4994.0 | 2 |
| 4995.0 | 2 |
| 4996.0 | 2 |
| 4997.0 | 2 |
| 4998.0 | 2 |
| 4999.0 | 2 |
| 5000.0 | 2 |